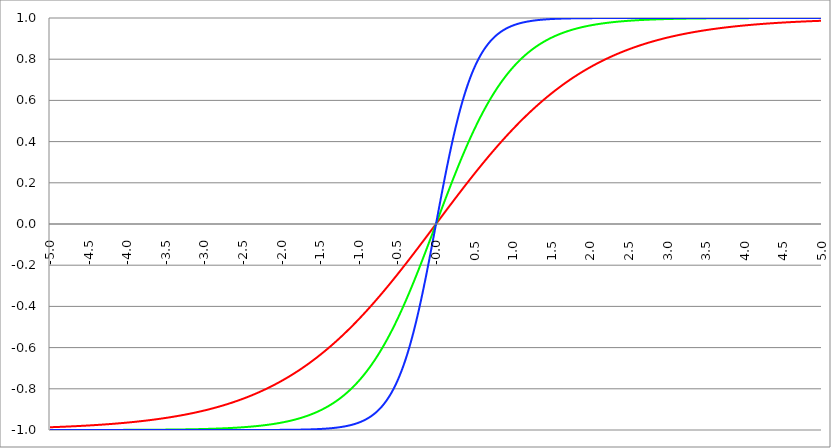
| Category | Series 1 | Series 0 | Series 2 |
|---|---|---|---|
| -5.0 | -0.987 | -1 | -1 |
| -4.995 | -0.987 | -1 | -1 |
| -4.99 | -0.986 | -1 | -1 |
| -4.985 | -0.986 | -1 | -1 |
| -4.98 | -0.986 | -1 | -1 |
| -4.975 | -0.986 | -1 | -1 |
| -4.97 | -0.986 | -1 | -1 |
| -4.965000000000001 | -0.986 | -1 | -1 |
| -4.960000000000001 | -0.986 | -1 | -1 |
| -4.955000000000001 | -0.986 | -1 | -1 |
| -4.950000000000001 | -0.986 | -1 | -1 |
| -4.945000000000001 | -0.986 | -1 | -1 |
| -4.940000000000001 | -0.986 | -1 | -1 |
| -4.935000000000001 | -0.986 | -1 | -1 |
| -4.930000000000001 | -0.986 | -1 | -1 |
| -4.925000000000002 | -0.986 | -1 | -1 |
| -4.920000000000002 | -0.986 | -1 | -1 |
| -4.915000000000002 | -0.985 | -1 | -1 |
| -4.910000000000002 | -0.985 | -1 | -1 |
| -4.905000000000002 | -0.985 | -1 | -1 |
| -4.900000000000002 | -0.985 | -1 | -1 |
| -4.895000000000002 | -0.985 | -1 | -1 |
| -4.890000000000002 | -0.985 | -1 | -1 |
| -4.885000000000002 | -0.985 | -1 | -1 |
| -4.880000000000002 | -0.985 | -1 | -1 |
| -4.875000000000003 | -0.985 | -1 | -1 |
| -4.870000000000003 | -0.985 | -1 | -1 |
| -4.865000000000003 | -0.985 | -1 | -1 |
| -4.860000000000003 | -0.985 | -1 | -1 |
| -4.855000000000003 | -0.985 | -1 | -1 |
| -4.850000000000003 | -0.984 | -1 | -1 |
| -4.845000000000003 | -0.984 | -1 | -1 |
| -4.840000000000003 | -0.984 | -1 | -1 |
| -4.835000000000003 | -0.984 | -1 | -1 |
| -4.830000000000004 | -0.984 | -1 | -1 |
| -4.825000000000004 | -0.984 | -1 | -1 |
| -4.820000000000004 | -0.984 | -1 | -1 |
| -4.815000000000004 | -0.984 | -1 | -1 |
| -4.810000000000004 | -0.984 | -1 | -1 |
| -4.805000000000004 | -0.984 | -1 | -1 |
| -4.800000000000004 | -0.984 | -1 | -1 |
| -4.795000000000004 | -0.984 | -1 | -1 |
| -4.790000000000004 | -0.984 | -1 | -1 |
| -4.785000000000004 | -0.983 | -1 | -1 |
| -4.780000000000004 | -0.983 | -1 | -1 |
| -4.775000000000004 | -0.983 | -1 | -1 |
| -4.770000000000004 | -0.983 | -1 | -1 |
| -4.765000000000005 | -0.983 | -1 | -1 |
| -4.760000000000005 | -0.983 | -1 | -1 |
| -4.755000000000005 | -0.983 | -1 | -1 |
| -4.750000000000005 | -0.983 | -1 | -1 |
| -4.745000000000005 | -0.983 | -1 | -1 |
| -4.740000000000005 | -0.983 | -1 | -1 |
| -4.735000000000005 | -0.983 | -1 | -1 |
| -4.730000000000005 | -0.983 | -1 | -1 |
| -4.725000000000006 | -0.982 | -1 | -1 |
| -4.720000000000006 | -0.982 | -1 | -1 |
| -4.715000000000006 | -0.982 | -1 | -1 |
| -4.710000000000006 | -0.982 | -1 | -1 |
| -4.705000000000006 | -0.982 | -1 | -1 |
| -4.700000000000006 | -0.982 | -1 | -1 |
| -4.695000000000006 | -0.982 | -1 | -1 |
| -4.690000000000006 | -0.982 | -1 | -1 |
| -4.685000000000007 | -0.982 | -1 | -1 |
| -4.680000000000007 | -0.982 | -1 | -1 |
| -4.675000000000007 | -0.982 | -1 | -1 |
| -4.670000000000007 | -0.981 | -1 | -1 |
| -4.665000000000007 | -0.981 | -1 | -1 |
| -4.660000000000007 | -0.981 | -1 | -1 |
| -4.655000000000007 | -0.981 | -1 | -1 |
| -4.650000000000007 | -0.981 | -1 | -1 |
| -4.645000000000007 | -0.981 | -1 | -1 |
| -4.640000000000008 | -0.981 | -1 | -1 |
| -4.635000000000008 | -0.981 | -1 | -1 |
| -4.630000000000008 | -0.981 | -1 | -1 |
| -4.625000000000008 | -0.981 | -1 | -1 |
| -4.620000000000008 | -0.98 | -1 | -1 |
| -4.615000000000008 | -0.98 | -1 | -1 |
| -4.610000000000008 | -0.98 | -1 | -1 |
| -4.605000000000008 | -0.98 | -1 | -1 |
| -4.600000000000008 | -0.98 | -1 | -1 |
| -4.595000000000009 | -0.98 | -1 | -1 |
| -4.590000000000009 | -0.98 | -1 | -1 |
| -4.585000000000009 | -0.98 | -1 | -1 |
| -4.580000000000009 | -0.98 | -1 | -1 |
| -4.57500000000001 | -0.98 | -1 | -1 |
| -4.57000000000001 | -0.979 | -1 | -1 |
| -4.565000000000009 | -0.979 | -1 | -1 |
| -4.560000000000009 | -0.979 | -1 | -1 |
| -4.555000000000009 | -0.979 | -1 | -1 |
| -4.55000000000001 | -0.979 | -1 | -1 |
| -4.54500000000001 | -0.979 | -1 | -1 |
| -4.54000000000001 | -0.979 | -1 | -1 |
| -4.53500000000001 | -0.979 | -1 | -1 |
| -4.53000000000001 | -0.979 | -1 | -1 |
| -4.52500000000001 | -0.979 | -1 | -1 |
| -4.52000000000001 | -0.978 | -1 | -1 |
| -4.51500000000001 | -0.978 | -1 | -1 |
| -4.51000000000001 | -0.978 | -1 | -1 |
| -4.505000000000011 | -0.978 | -1 | -1 |
| -4.500000000000011 | -0.978 | -1 | -1 |
| -4.495000000000011 | -0.978 | -1 | -1 |
| -4.490000000000011 | -0.978 | -1 | -1 |
| -4.485000000000011 | -0.978 | -1 | -1 |
| -4.480000000000011 | -0.978 | -1 | -1 |
| -4.475000000000011 | -0.977 | -1 | -1 |
| -4.470000000000011 | -0.977 | -1 | -1 |
| -4.465000000000011 | -0.977 | -1 | -1 |
| -4.460000000000011 | -0.977 | -1 | -1 |
| -4.455000000000012 | -0.977 | -1 | -1 |
| -4.450000000000012 | -0.977 | -1 | -1 |
| -4.445000000000012 | -0.977 | -1 | -1 |
| -4.440000000000012 | -0.977 | -1 | -1 |
| -4.435000000000012 | -0.977 | -1 | -1 |
| -4.430000000000012 | -0.976 | -1 | -1 |
| -4.425000000000012 | -0.976 | -1 | -1 |
| -4.420000000000012 | -0.976 | -1 | -1 |
| -4.415000000000012 | -0.976 | -1 | -1 |
| -4.410000000000013 | -0.976 | -1 | -1 |
| -4.405000000000013 | -0.976 | -1 | -1 |
| -4.400000000000013 | -0.976 | -1 | -1 |
| -4.395000000000013 | -0.976 | -1 | -1 |
| -4.390000000000013 | -0.976 | -1 | -1 |
| -4.385000000000013 | -0.975 | -1 | -1 |
| -4.380000000000013 | -0.975 | -1 | -1 |
| -4.375000000000013 | -0.975 | -1 | -1 |
| -4.370000000000013 | -0.975 | -1 | -1 |
| -4.365000000000013 | -0.975 | -1 | -1 |
| -4.360000000000014 | -0.975 | -1 | -1 |
| -4.355000000000014 | -0.975 | -1 | -1 |
| -4.350000000000014 | -0.975 | -1 | -1 |
| -4.345000000000014 | -0.974 | -1 | -1 |
| -4.340000000000014 | -0.974 | -1 | -1 |
| -4.335000000000014 | -0.974 | -1 | -1 |
| -4.330000000000014 | -0.974 | -1 | -1 |
| -4.325000000000014 | -0.974 | -1 | -1 |
| -4.320000000000014 | -0.974 | -1 | -1 |
| -4.315000000000015 | -0.974 | -1 | -1 |
| -4.310000000000015 | -0.973 | -1 | -1 |
| -4.305000000000015 | -0.973 | -1 | -1 |
| -4.300000000000015 | -0.973 | -1 | -1 |
| -4.295000000000015 | -0.973 | -1 | -1 |
| -4.290000000000015 | -0.973 | -1 | -1 |
| -4.285000000000015 | -0.973 | -1 | -1 |
| -4.280000000000015 | -0.973 | -1 | -1 |
| -4.275000000000015 | -0.973 | -1 | -1 |
| -4.270000000000015 | -0.972 | -1 | -1 |
| -4.265000000000016 | -0.972 | -1 | -1 |
| -4.260000000000016 | -0.972 | -1 | -1 |
| -4.255000000000016 | -0.972 | -1 | -1 |
| -4.250000000000016 | -0.972 | -1 | -1 |
| -4.245000000000016 | -0.972 | -1 | -1 |
| -4.240000000000016 | -0.972 | -1 | -1 |
| -4.235000000000016 | -0.971 | -1 | -1 |
| -4.230000000000016 | -0.971 | -1 | -1 |
| -4.225000000000017 | -0.971 | -1 | -1 |
| -4.220000000000017 | -0.971 | -1 | -1 |
| -4.215000000000017 | -0.971 | -1 | -1 |
| -4.210000000000017 | -0.971 | -1 | -1 |
| -4.205000000000017 | -0.971 | -1 | -1 |
| -4.200000000000017 | -0.97 | -1 | -1 |
| -4.195000000000017 | -0.97 | -1 | -1 |
| -4.190000000000017 | -0.97 | -1 | -1 |
| -4.185000000000017 | -0.97 | -1 | -1 |
| -4.180000000000017 | -0.97 | -1 | -1 |
| -4.175000000000018 | -0.97 | -1 | -1 |
| -4.170000000000018 | -0.97 | -1 | -1 |
| -4.165000000000018 | -0.969 | -1 | -1 |
| -4.160000000000018 | -0.969 | -1 | -1 |
| -4.155000000000018 | -0.969 | -1 | -1 |
| -4.150000000000018 | -0.969 | -1 | -1 |
| -4.145000000000018 | -0.969 | -0.999 | -1 |
| -4.140000000000018 | -0.969 | -0.999 | -1 |
| -4.135000000000018 | -0.968 | -0.999 | -1 |
| -4.130000000000019 | -0.968 | -0.999 | -1 |
| -4.125000000000019 | -0.968 | -0.999 | -1 |
| -4.120000000000019 | -0.968 | -0.999 | -1 |
| -4.115000000000019 | -0.968 | -0.999 | -1 |
| -4.110000000000019 | -0.968 | -0.999 | -1 |
| -4.105000000000019 | -0.968 | -0.999 | -1 |
| -4.100000000000019 | -0.967 | -0.999 | -1 |
| -4.095000000000019 | -0.967 | -0.999 | -1 |
| -4.090000000000019 | -0.967 | -0.999 | -1 |
| -4.085000000000019 | -0.967 | -0.999 | -1 |
| -4.08000000000002 | -0.967 | -0.999 | -1 |
| -4.07500000000002 | -0.967 | -0.999 | -1 |
| -4.07000000000002 | -0.966 | -0.999 | -1 |
| -4.06500000000002 | -0.966 | -0.999 | -1 |
| -4.06000000000002 | -0.966 | -0.999 | -1 |
| -4.05500000000002 | -0.966 | -0.999 | -1 |
| -4.05000000000002 | -0.966 | -0.999 | -1 |
| -4.04500000000002 | -0.966 | -0.999 | -1 |
| -4.04000000000002 | -0.965 | -0.999 | -1 |
| -4.03500000000002 | -0.965 | -0.999 | -1 |
| -4.03000000000002 | -0.965 | -0.999 | -1 |
| -4.025000000000021 | -0.965 | -0.999 | -1 |
| -4.020000000000021 | -0.965 | -0.999 | -1 |
| -4.015000000000021 | -0.965 | -0.999 | -1 |
| -4.010000000000021 | -0.964 | -0.999 | -1 |
| -4.005000000000021 | -0.964 | -0.999 | -1 |
| -4.000000000000021 | -0.964 | -0.999 | -1 |
| -3.995000000000021 | -0.964 | -0.999 | -1 |
| -3.990000000000021 | -0.964 | -0.999 | -1 |
| -3.985000000000022 | -0.963 | -0.999 | -1 |
| -3.980000000000022 | -0.963 | -0.999 | -1 |
| -3.975000000000022 | -0.963 | -0.999 | -1 |
| -3.970000000000022 | -0.963 | -0.999 | -1 |
| -3.965000000000022 | -0.963 | -0.999 | -1 |
| -3.960000000000022 | -0.963 | -0.999 | -1 |
| -3.955000000000022 | -0.962 | -0.999 | -1 |
| -3.950000000000022 | -0.962 | -0.999 | -1 |
| -3.945000000000022 | -0.962 | -0.999 | -1 |
| -3.940000000000023 | -0.962 | -0.999 | -1 |
| -3.935000000000023 | -0.962 | -0.999 | -1 |
| -3.930000000000023 | -0.961 | -0.999 | -1 |
| -3.925000000000023 | -0.961 | -0.999 | -1 |
| -3.920000000000023 | -0.961 | -0.999 | -1 |
| -3.915000000000023 | -0.961 | -0.999 | -1 |
| -3.910000000000023 | -0.961 | -0.999 | -1 |
| -3.905000000000023 | -0.961 | -0.999 | -1 |
| -3.900000000000023 | -0.96 | -0.999 | -1 |
| -3.895000000000023 | -0.96 | -0.999 | -1 |
| -3.890000000000024 | -0.96 | -0.999 | -1 |
| -3.885000000000024 | -0.96 | -0.999 | -1 |
| -3.880000000000024 | -0.96 | -0.999 | -1 |
| -3.875000000000024 | -0.959 | -0.999 | -1 |
| -3.870000000000024 | -0.959 | -0.999 | -1 |
| -3.865000000000024 | -0.959 | -0.999 | -1 |
| -3.860000000000024 | -0.959 | -0.999 | -1 |
| -3.855000000000024 | -0.959 | -0.999 | -1 |
| -3.850000000000024 | -0.958 | -0.999 | -1 |
| -3.845000000000025 | -0.958 | -0.999 | -1 |
| -3.840000000000025 | -0.958 | -0.999 | -1 |
| -3.835000000000025 | -0.958 | -0.999 | -1 |
| -3.830000000000025 | -0.958 | -0.999 | -1 |
| -3.825000000000025 | -0.957 | -0.999 | -1 |
| -3.820000000000025 | -0.957 | -0.999 | -1 |
| -3.815000000000025 | -0.957 | -0.999 | -1 |
| -3.810000000000025 | -0.957 | -0.999 | -1 |
| -3.805000000000025 | -0.956 | -0.999 | -1 |
| -3.800000000000026 | -0.956 | -0.999 | -1 |
| -3.795000000000026 | -0.956 | -0.999 | -1 |
| -3.790000000000026 | -0.956 | -0.999 | -1 |
| -3.785000000000026 | -0.956 | -0.999 | -1 |
| -3.780000000000026 | -0.955 | -0.999 | -1 |
| -3.775000000000026 | -0.955 | -0.999 | -1 |
| -3.770000000000026 | -0.955 | -0.999 | -1 |
| -3.765000000000026 | -0.955 | -0.999 | -1 |
| -3.760000000000026 | -0.954 | -0.999 | -1 |
| -3.755000000000026 | -0.954 | -0.999 | -1 |
| -3.750000000000027 | -0.954 | -0.999 | -1 |
| -3.745000000000027 | -0.954 | -0.999 | -1 |
| -3.740000000000027 | -0.954 | -0.999 | -1 |
| -3.735000000000027 | -0.953 | -0.999 | -1 |
| -3.730000000000027 | -0.953 | -0.999 | -1 |
| -3.725000000000027 | -0.953 | -0.999 | -1 |
| -3.720000000000027 | -0.953 | -0.999 | -1 |
| -3.715000000000027 | -0.952 | -0.999 | -1 |
| -3.710000000000027 | -0.952 | -0.999 | -1 |
| -3.705000000000028 | -0.952 | -0.999 | -1 |
| -3.700000000000028 | -0.952 | -0.999 | -1 |
| -3.695000000000028 | -0.952 | -0.999 | -1 |
| -3.690000000000028 | -0.951 | -0.999 | -1 |
| -3.685000000000028 | -0.951 | -0.999 | -1 |
| -3.680000000000028 | -0.951 | -0.999 | -1 |
| -3.675000000000028 | -0.951 | -0.999 | -1 |
| -3.670000000000028 | -0.95 | -0.999 | -1 |
| -3.665000000000028 | -0.95 | -0.999 | -1 |
| -3.660000000000028 | -0.95 | -0.999 | -1 |
| -3.655000000000029 | -0.95 | -0.999 | -1 |
| -3.650000000000029 | -0.949 | -0.999 | -1 |
| -3.645000000000029 | -0.949 | -0.999 | -1 |
| -3.640000000000029 | -0.949 | -0.999 | -1 |
| -3.635000000000029 | -0.949 | -0.999 | -1 |
| -3.630000000000029 | -0.948 | -0.999 | -1 |
| -3.625000000000029 | -0.948 | -0.999 | -1 |
| -3.620000000000029 | -0.948 | -0.999 | -1 |
| -3.615000000000029 | -0.948 | -0.999 | -1 |
| -3.61000000000003 | -0.947 | -0.999 | -1 |
| -3.60500000000003 | -0.947 | -0.999 | -1 |
| -3.60000000000003 | -0.947 | -0.999 | -1 |
| -3.59500000000003 | -0.947 | -0.998 | -1 |
| -3.59000000000003 | -0.946 | -0.998 | -1 |
| -3.58500000000003 | -0.946 | -0.998 | -1 |
| -3.58000000000003 | -0.946 | -0.998 | -1 |
| -3.57500000000003 | -0.945 | -0.998 | -1 |
| -3.57000000000003 | -0.945 | -0.998 | -1 |
| -3.565000000000031 | -0.945 | -0.998 | -1 |
| -3.560000000000031 | -0.945 | -0.998 | -1 |
| -3.555000000000031 | -0.944 | -0.998 | -1 |
| -3.550000000000031 | -0.944 | -0.998 | -1 |
| -3.545000000000031 | -0.944 | -0.998 | -1 |
| -3.540000000000031 | -0.944 | -0.998 | -1 |
| -3.535000000000031 | -0.943 | -0.998 | -1 |
| -3.530000000000031 | -0.943 | -0.998 | -1 |
| -3.525000000000031 | -0.943 | -0.998 | -1 |
| -3.520000000000032 | -0.943 | -0.998 | -1 |
| -3.515000000000032 | -0.942 | -0.998 | -1 |
| -3.510000000000032 | -0.942 | -0.998 | -1 |
| -3.505000000000032 | -0.942 | -0.998 | -1 |
| -3.500000000000032 | -0.941 | -0.998 | -1 |
| -3.495000000000032 | -0.941 | -0.998 | -1 |
| -3.490000000000032 | -0.941 | -0.998 | -1 |
| -3.485000000000032 | -0.941 | -0.998 | -1 |
| -3.480000000000032 | -0.94 | -0.998 | -1 |
| -3.475000000000032 | -0.94 | -0.998 | -1 |
| -3.470000000000033 | -0.94 | -0.998 | -1 |
| -3.465000000000033 | -0.939 | -0.998 | -1 |
| -3.460000000000033 | -0.939 | -0.998 | -1 |
| -3.455000000000033 | -0.939 | -0.998 | -1 |
| -3.450000000000033 | -0.938 | -0.998 | -1 |
| -3.445000000000033 | -0.938 | -0.998 | -1 |
| -3.440000000000033 | -0.938 | -0.998 | -1 |
| -3.435000000000033 | -0.938 | -0.998 | -1 |
| -3.430000000000033 | -0.937 | -0.998 | -1 |
| -3.425000000000034 | -0.937 | -0.998 | -1 |
| -3.420000000000034 | -0.937 | -0.998 | -1 |
| -3.415000000000034 | -0.936 | -0.998 | -1 |
| -3.410000000000034 | -0.936 | -0.998 | -1 |
| -3.405000000000034 | -0.936 | -0.998 | -1 |
| -3.400000000000034 | -0.935 | -0.998 | -1 |
| -3.395000000000034 | -0.935 | -0.998 | -1 |
| -3.390000000000034 | -0.935 | -0.998 | -1 |
| -3.385000000000034 | -0.934 | -0.998 | -1 |
| -3.380000000000034 | -0.934 | -0.998 | -1 |
| -3.375000000000035 | -0.934 | -0.998 | -1 |
| -3.370000000000035 | -0.934 | -0.998 | -1 |
| -3.365000000000035 | -0.933 | -0.998 | -1 |
| -3.360000000000035 | -0.933 | -0.998 | -1 |
| -3.355000000000035 | -0.933 | -0.998 | -1 |
| -3.350000000000035 | -0.932 | -0.998 | -1 |
| -3.345000000000035 | -0.932 | -0.998 | -1 |
| -3.340000000000035 | -0.932 | -0.997 | -1 |
| -3.335000000000035 | -0.931 | -0.997 | -1 |
| -3.330000000000036 | -0.931 | -0.997 | -1 |
| -3.325000000000036 | -0.931 | -0.997 | -1 |
| -3.320000000000036 | -0.93 | -0.997 | -1 |
| -3.315000000000036 | -0.93 | -0.997 | -1 |
| -3.310000000000036 | -0.93 | -0.997 | -1 |
| -3.305000000000036 | -0.929 | -0.997 | -1 |
| -3.300000000000036 | -0.929 | -0.997 | -1 |
| -3.295000000000036 | -0.929 | -0.997 | -1 |
| -3.290000000000036 | -0.928 | -0.997 | -1 |
| -3.285000000000036 | -0.928 | -0.997 | -1 |
| -3.280000000000036 | -0.927 | -0.997 | -1 |
| -3.275000000000037 | -0.927 | -0.997 | -1 |
| -3.270000000000037 | -0.927 | -0.997 | -1 |
| -3.265000000000037 | -0.926 | -0.997 | -1 |
| -3.260000000000037 | -0.926 | -0.997 | -1 |
| -3.255000000000037 | -0.926 | -0.997 | -1 |
| -3.250000000000037 | -0.925 | -0.997 | -1 |
| -3.245000000000037 | -0.925 | -0.997 | -1 |
| -3.240000000000037 | -0.925 | -0.997 | -1 |
| -3.235000000000038 | -0.924 | -0.997 | -1 |
| -3.230000000000038 | -0.924 | -0.997 | -1 |
| -3.225000000000038 | -0.924 | -0.997 | -1 |
| -3.220000000000038 | -0.923 | -0.997 | -1 |
| -3.215000000000038 | -0.923 | -0.997 | -1 |
| -3.210000000000038 | -0.922 | -0.997 | -1 |
| -3.205000000000038 | -0.922 | -0.997 | -1 |
| -3.200000000000038 | -0.922 | -0.997 | -1 |
| -3.195000000000038 | -0.921 | -0.997 | -1 |
| -3.190000000000039 | -0.921 | -0.997 | -1 |
| -3.185000000000039 | -0.921 | -0.997 | -1 |
| -3.180000000000039 | -0.92 | -0.997 | -1 |
| -3.175000000000039 | -0.92 | -0.997 | -1 |
| -3.170000000000039 | -0.919 | -0.996 | -1 |
| -3.16500000000004 | -0.919 | -0.996 | -1 |
| -3.16000000000004 | -0.919 | -0.996 | -1 |
| -3.155000000000039 | -0.918 | -0.996 | -1 |
| -3.150000000000039 | -0.918 | -0.996 | -1 |
| -3.14500000000004 | -0.917 | -0.996 | -1 |
| -3.14000000000004 | -0.917 | -0.996 | -1 |
| -3.13500000000004 | -0.917 | -0.996 | -1 |
| -3.13000000000004 | -0.916 | -0.996 | -1 |
| -3.12500000000004 | -0.916 | -0.996 | -1 |
| -3.12000000000004 | -0.915 | -0.996 | -1 |
| -3.11500000000004 | -0.915 | -0.996 | -1 |
| -3.11000000000004 | -0.915 | -0.996 | -1 |
| -3.10500000000004 | -0.914 | -0.996 | -1 |
| -3.10000000000004 | -0.914 | -0.996 | -1 |
| -3.095000000000041 | -0.913 | -0.996 | -1 |
| -3.090000000000041 | -0.913 | -0.996 | -1 |
| -3.085000000000041 | -0.913 | -0.996 | -1 |
| -3.080000000000041 | -0.912 | -0.996 | -1 |
| -3.075000000000041 | -0.912 | -0.996 | -1 |
| -3.070000000000041 | -0.911 | -0.996 | -1 |
| -3.065000000000041 | -0.911 | -0.996 | -1 |
| -3.060000000000041 | -0.91 | -0.996 | -1 |
| -3.055000000000041 | -0.91 | -0.996 | -1 |
| -3.050000000000042 | -0.91 | -0.996 | -1 |
| -3.045000000000042 | -0.909 | -0.995 | -1 |
| -3.040000000000042 | -0.909 | -0.995 | -1 |
| -3.035000000000042 | -0.908 | -0.995 | -1 |
| -3.030000000000042 | -0.908 | -0.995 | -1 |
| -3.025000000000042 | -0.907 | -0.995 | -1 |
| -3.020000000000042 | -0.907 | -0.995 | -1 |
| -3.015000000000042 | -0.906 | -0.995 | -1 |
| -3.010000000000042 | -0.906 | -0.995 | -1 |
| -3.005000000000043 | -0.906 | -0.995 | -1 |
| -3.000000000000043 | -0.905 | -0.995 | -1 |
| -2.995000000000043 | -0.905 | -0.995 | -1 |
| -2.990000000000043 | -0.904 | -0.995 | -1 |
| -2.985000000000043 | -0.904 | -0.995 | -1 |
| -2.980000000000043 | -0.903 | -0.995 | -1 |
| -2.975000000000043 | -0.903 | -0.995 | -1 |
| -2.970000000000043 | -0.902 | -0.995 | -1 |
| -2.965000000000043 | -0.902 | -0.995 | -1 |
| -2.960000000000043 | -0.901 | -0.995 | -1 |
| -2.955000000000044 | -0.901 | -0.995 | -1 |
| -2.950000000000044 | -0.901 | -0.995 | -1 |
| -2.945000000000044 | -0.9 | -0.994 | -1 |
| -2.940000000000044 | -0.9 | -0.994 | -1 |
| -2.935000000000044 | -0.899 | -0.994 | -1 |
| -2.930000000000044 | -0.899 | -0.994 | -1 |
| -2.925000000000044 | -0.898 | -0.994 | -1 |
| -2.920000000000044 | -0.898 | -0.994 | -1 |
| -2.915000000000044 | -0.897 | -0.994 | -1 |
| -2.910000000000045 | -0.897 | -0.994 | -1 |
| -2.905000000000045 | -0.896 | -0.994 | -1 |
| -2.900000000000045 | -0.896 | -0.994 | -1 |
| -2.895000000000045 | -0.895 | -0.994 | -1 |
| -2.890000000000045 | -0.895 | -0.994 | -1 |
| -2.885000000000045 | -0.894 | -0.994 | -1 |
| -2.880000000000045 | -0.894 | -0.994 | -1 |
| -2.875000000000045 | -0.893 | -0.994 | -1 |
| -2.870000000000045 | -0.893 | -0.994 | -1 |
| -2.865000000000045 | -0.892 | -0.994 | -1 |
| -2.860000000000046 | -0.892 | -0.993 | -1 |
| -2.855000000000046 | -0.891 | -0.993 | -1 |
| -2.850000000000046 | -0.891 | -0.993 | -1 |
| -2.845000000000046 | -0.89 | -0.993 | -1 |
| -2.840000000000046 | -0.89 | -0.993 | -1 |
| -2.835000000000046 | -0.889 | -0.993 | -1 |
| -2.830000000000046 | -0.889 | -0.993 | -1 |
| -2.825000000000046 | -0.888 | -0.993 | -1 |
| -2.820000000000046 | -0.887 | -0.993 | -1 |
| -2.815000000000047 | -0.887 | -0.993 | -1 |
| -2.810000000000047 | -0.886 | -0.993 | -1 |
| -2.805000000000047 | -0.886 | -0.993 | -1 |
| -2.800000000000047 | -0.885 | -0.993 | -1 |
| -2.795000000000047 | -0.885 | -0.993 | -1 |
| -2.790000000000047 | -0.884 | -0.992 | -1 |
| -2.785000000000047 | -0.884 | -0.992 | -1 |
| -2.780000000000047 | -0.883 | -0.992 | -1 |
| -2.775000000000047 | -0.883 | -0.992 | -1 |
| -2.770000000000047 | -0.882 | -0.992 | -1 |
| -2.765000000000048 | -0.882 | -0.992 | -1 |
| -2.760000000000048 | -0.881 | -0.992 | -1 |
| -2.755000000000048 | -0.88 | -0.992 | -1 |
| -2.750000000000048 | -0.88 | -0.992 | -1 |
| -2.745000000000048 | -0.879 | -0.992 | -1 |
| -2.740000000000048 | -0.879 | -0.992 | -1 |
| -2.735000000000048 | -0.878 | -0.992 | -1 |
| -2.730000000000048 | -0.878 | -0.992 | -1 |
| -2.725000000000048 | -0.877 | -0.991 | -1 |
| -2.720000000000049 | -0.876 | -0.991 | -1 |
| -2.715000000000049 | -0.876 | -0.991 | -1 |
| -2.710000000000049 | -0.875 | -0.991 | -1 |
| -2.705000000000049 | -0.875 | -0.991 | -1 |
| -2.700000000000049 | -0.874 | -0.991 | -1 |
| -2.695000000000049 | -0.873 | -0.991 | -1 |
| -2.690000000000049 | -0.873 | -0.991 | -1 |
| -2.685000000000049 | -0.872 | -0.991 | -1 |
| -2.680000000000049 | -0.872 | -0.991 | -1 |
| -2.675000000000049 | -0.871 | -0.991 | -1 |
| -2.67000000000005 | -0.87 | -0.99 | -1 |
| -2.66500000000005 | -0.87 | -0.99 | -1 |
| -2.66000000000005 | -0.869 | -0.99 | -1 |
| -2.65500000000005 | -0.869 | -0.99 | -1 |
| -2.65000000000005 | -0.868 | -0.99 | -1 |
| -2.64500000000005 | -0.867 | -0.99 | -1 |
| -2.64000000000005 | -0.867 | -0.99 | -1 |
| -2.63500000000005 | -0.866 | -0.99 | -1 |
| -2.63000000000005 | -0.866 | -0.99 | -1 |
| -2.625000000000051 | -0.865 | -0.99 | -1 |
| -2.620000000000051 | -0.864 | -0.989 | -1 |
| -2.615000000000051 | -0.864 | -0.989 | -1 |
| -2.610000000000051 | -0.863 | -0.989 | -1 |
| -2.605000000000051 | -0.862 | -0.989 | -1 |
| -2.600000000000051 | -0.862 | -0.989 | -1 |
| -2.595000000000051 | -0.861 | -0.989 | -1 |
| -2.590000000000051 | -0.86 | -0.989 | -1 |
| -2.585000000000051 | -0.86 | -0.989 | -1 |
| -2.580000000000052 | -0.859 | -0.989 | -1 |
| -2.575000000000052 | -0.858 | -0.988 | -1 |
| -2.570000000000052 | -0.858 | -0.988 | -1 |
| -2.565000000000052 | -0.857 | -0.988 | -1 |
| -2.560000000000052 | -0.856 | -0.988 | -1 |
| -2.555000000000052 | -0.856 | -0.988 | -1 |
| -2.550000000000052 | -0.855 | -0.988 | -1 |
| -2.545000000000052 | -0.854 | -0.988 | -1 |
| -2.540000000000052 | -0.854 | -0.988 | -1 |
| -2.535000000000053 | -0.853 | -0.988 | -1 |
| -2.530000000000053 | -0.852 | -0.987 | -1 |
| -2.525000000000053 | -0.852 | -0.987 | -1 |
| -2.520000000000053 | -0.851 | -0.987 | -1 |
| -2.515000000000053 | -0.85 | -0.987 | -1 |
| -2.510000000000053 | -0.85 | -0.987 | -1 |
| -2.505000000000053 | -0.849 | -0.987 | -1 |
| -2.500000000000053 | -0.848 | -0.987 | -1 |
| -2.495000000000053 | -0.848 | -0.986 | -1 |
| -2.490000000000053 | -0.847 | -0.986 | -1 |
| -2.485000000000054 | -0.846 | -0.986 | -1 |
| -2.480000000000054 | -0.845 | -0.986 | -1 |
| -2.475000000000054 | -0.845 | -0.986 | -1 |
| -2.470000000000054 | -0.844 | -0.986 | -1 |
| -2.465000000000054 | -0.843 | -0.986 | -1 |
| -2.460000000000054 | -0.843 | -0.986 | -1 |
| -2.455000000000054 | -0.842 | -0.985 | -1 |
| -2.450000000000054 | -0.841 | -0.985 | -1 |
| -2.445000000000054 | -0.84 | -0.985 | -1 |
| -2.440000000000055 | -0.84 | -0.985 | -1 |
| -2.435000000000055 | -0.839 | -0.985 | -1 |
| -2.430000000000055 | -0.838 | -0.985 | -1 |
| -2.425000000000055 | -0.837 | -0.984 | -1 |
| -2.420000000000055 | -0.837 | -0.984 | -1 |
| -2.415000000000055 | -0.836 | -0.984 | -1 |
| -2.410000000000055 | -0.835 | -0.984 | -1 |
| -2.405000000000055 | -0.834 | -0.984 | -1 |
| -2.400000000000055 | -0.834 | -0.984 | -1 |
| -2.395000000000055 | -0.833 | -0.984 | -1 |
| -2.390000000000056 | -0.832 | -0.983 | -1 |
| -2.385000000000056 | -0.831 | -0.983 | -1 |
| -2.380000000000056 | -0.831 | -0.983 | -1 |
| -2.375000000000056 | -0.83 | -0.983 | -1 |
| -2.370000000000056 | -0.829 | -0.983 | -1 |
| -2.365000000000056 | -0.828 | -0.983 | -1 |
| -2.360000000000056 | -0.827 | -0.982 | -1 |
| -2.355000000000056 | -0.827 | -0.982 | -1 |
| -2.350000000000056 | -0.826 | -0.982 | -1 |
| -2.345000000000057 | -0.825 | -0.982 | -1 |
| -2.340000000000057 | -0.824 | -0.982 | -1 |
| -2.335000000000057 | -0.823 | -0.981 | -1 |
| -2.330000000000057 | -0.823 | -0.981 | -1 |
| -2.325000000000057 | -0.822 | -0.981 | -1 |
| -2.320000000000057 | -0.821 | -0.981 | -1 |
| -2.315000000000057 | -0.82 | -0.981 | -1 |
| -2.310000000000057 | -0.819 | -0.98 | -1 |
| -2.305000000000057 | -0.819 | -0.98 | -1 |
| -2.300000000000058 | -0.818 | -0.98 | -1 |
| -2.295000000000058 | -0.817 | -0.98 | -1 |
| -2.290000000000058 | -0.816 | -0.98 | -1 |
| -2.285000000000058 | -0.815 | -0.979 | -1 |
| -2.280000000000058 | -0.814 | -0.979 | -1 |
| -2.275000000000058 | -0.814 | -0.979 | -1 |
| -2.270000000000058 | -0.813 | -0.979 | -1 |
| -2.265000000000058 | -0.812 | -0.979 | -1 |
| -2.260000000000058 | -0.811 | -0.978 | -1 |
| -2.255000000000058 | -0.81 | -0.978 | -1 |
| -2.250000000000059 | -0.809 | -0.978 | -1 |
| -2.245000000000059 | -0.808 | -0.978 | -1 |
| -2.240000000000059 | -0.808 | -0.978 | -1 |
| -2.235000000000059 | -0.807 | -0.977 | -1 |
| -2.23000000000006 | -0.806 | -0.977 | -1 |
| -2.22500000000006 | -0.805 | -0.977 | -1 |
| -2.22000000000006 | -0.804 | -0.977 | -1 |
| -2.215000000000059 | -0.803 | -0.976 | -1 |
| -2.210000000000059 | -0.802 | -0.976 | -1 |
| -2.20500000000006 | -0.801 | -0.976 | -1 |
| -2.20000000000006 | -0.8 | -0.976 | -1 |
| -2.19500000000006 | -0.8 | -0.976 | -1 |
| -2.19000000000006 | -0.799 | -0.975 | -1 |
| -2.18500000000006 | -0.798 | -0.975 | -1 |
| -2.18000000000006 | -0.797 | -0.975 | -1 |
| -2.17500000000006 | -0.796 | -0.975 | -1 |
| -2.17000000000006 | -0.795 | -0.974 | -1 |
| -2.16500000000006 | -0.794 | -0.974 | -1 |
| -2.160000000000061 | -0.793 | -0.974 | -1 |
| -2.155000000000061 | -0.792 | -0.973 | -1 |
| -2.150000000000061 | -0.791 | -0.973 | -1 |
| -2.145000000000061 | -0.79 | -0.973 | -1 |
| -2.140000000000061 | -0.789 | -0.973 | -1 |
| -2.135000000000061 | -0.789 | -0.972 | -1 |
| -2.130000000000061 | -0.788 | -0.972 | -1 |
| -2.125000000000061 | -0.787 | -0.972 | -1 |
| -2.120000000000061 | -0.786 | -0.972 | -1 |
| -2.115000000000061 | -0.785 | -0.971 | -1 |
| -2.110000000000062 | -0.784 | -0.971 | -1 |
| -2.105000000000062 | -0.783 | -0.971 | -1 |
| -2.100000000000062 | -0.782 | -0.97 | -1 |
| -2.095000000000062 | -0.781 | -0.97 | -1 |
| -2.090000000000062 | -0.78 | -0.97 | -1 |
| -2.085000000000062 | -0.779 | -0.97 | -1 |
| -2.080000000000062 | -0.778 | -0.969 | -1 |
| -2.075000000000062 | -0.777 | -0.969 | -1 |
| -2.070000000000062 | -0.776 | -0.969 | -0.999 |
| -2.065000000000063 | -0.775 | -0.968 | -0.999 |
| -2.060000000000063 | -0.774 | -0.968 | -0.999 |
| -2.055000000000063 | -0.773 | -0.968 | -0.999 |
| -2.050000000000063 | -0.772 | -0.967 | -0.999 |
| -2.045000000000063 | -0.771 | -0.967 | -0.999 |
| -2.040000000000063 | -0.77 | -0.967 | -0.999 |
| -2.035000000000063 | -0.769 | -0.966 | -0.999 |
| -2.030000000000063 | -0.768 | -0.966 | -0.999 |
| -2.025000000000063 | -0.767 | -0.966 | -0.999 |
| -2.020000000000064 | -0.766 | -0.965 | -0.999 |
| -2.015000000000064 | -0.765 | -0.965 | -0.999 |
| -2.010000000000064 | -0.764 | -0.965 | -0.999 |
| -2.005000000000064 | -0.763 | -0.964 | -0.999 |
| -2.000000000000064 | -0.762 | -0.964 | -0.999 |
| -1.995000000000064 | -0.761 | -0.964 | -0.999 |
| -1.990000000000064 | -0.759 | -0.963 | -0.999 |
| -1.985000000000064 | -0.758 | -0.963 | -0.999 |
| -1.980000000000064 | -0.757 | -0.963 | -0.999 |
| -1.975000000000064 | -0.756 | -0.962 | -0.999 |
| -1.970000000000065 | -0.755 | -0.962 | -0.999 |
| -1.965000000000065 | -0.754 | -0.961 | -0.999 |
| -1.960000000000065 | -0.753 | -0.961 | -0.999 |
| -1.955000000000065 | -0.752 | -0.961 | -0.999 |
| -1.950000000000065 | -0.751 | -0.96 | -0.999 |
| -1.945000000000065 | -0.75 | -0.96 | -0.999 |
| -1.940000000000065 | -0.749 | -0.96 | -0.999 |
| -1.935000000000065 | -0.748 | -0.959 | -0.999 |
| -1.930000000000065 | -0.746 | -0.959 | -0.999 |
| -1.925000000000066 | -0.745 | -0.958 | -0.999 |
| -1.920000000000066 | -0.744 | -0.958 | -0.999 |
| -1.915000000000066 | -0.743 | -0.958 | -0.999 |
| -1.910000000000066 | -0.742 | -0.957 | -0.999 |
| -1.905000000000066 | -0.741 | -0.957 | -0.999 |
| -1.900000000000066 | -0.74 | -0.956 | -0.999 |
| -1.895000000000066 | -0.739 | -0.956 | -0.999 |
| -1.890000000000066 | -0.738 | -0.955 | -0.999 |
| -1.885000000000066 | -0.736 | -0.955 | -0.999 |
| -1.880000000000066 | -0.735 | -0.954 | -0.999 |
| -1.875000000000067 | -0.734 | -0.954 | -0.999 |
| -1.870000000000067 | -0.733 | -0.954 | -0.999 |
| -1.865000000000067 | -0.732 | -0.953 | -0.999 |
| -1.860000000000067 | -0.731 | -0.953 | -0.999 |
| -1.855000000000067 | -0.729 | -0.952 | -0.999 |
| -1.850000000000067 | -0.728 | -0.952 | -0.999 |
| -1.845000000000067 | -0.727 | -0.951 | -0.999 |
| -1.840000000000067 | -0.726 | -0.951 | -0.999 |
| -1.835000000000067 | -0.725 | -0.95 | -0.999 |
| -1.830000000000068 | -0.724 | -0.95 | -0.999 |
| -1.825000000000068 | -0.722 | -0.949 | -0.999 |
| -1.820000000000068 | -0.721 | -0.949 | -0.999 |
| -1.815000000000068 | -0.72 | -0.948 | -0.999 |
| -1.810000000000068 | -0.719 | -0.948 | -0.999 |
| -1.805000000000068 | -0.718 | -0.947 | -0.999 |
| -1.800000000000068 | -0.716 | -0.947 | -0.999 |
| -1.795000000000068 | -0.715 | -0.946 | -0.998 |
| -1.790000000000068 | -0.714 | -0.946 | -0.998 |
| -1.785000000000068 | -0.713 | -0.945 | -0.998 |
| -1.780000000000069 | -0.711 | -0.945 | -0.998 |
| -1.775000000000069 | -0.71 | -0.944 | -0.998 |
| -1.770000000000069 | -0.709 | -0.944 | -0.998 |
| -1.765000000000069 | -0.708 | -0.943 | -0.998 |
| -1.760000000000069 | -0.706 | -0.943 | -0.998 |
| -1.75500000000007 | -0.705 | -0.942 | -0.998 |
| -1.75000000000007 | -0.704 | -0.941 | -0.998 |
| -1.745000000000069 | -0.703 | -0.941 | -0.998 |
| -1.740000000000069 | -0.701 | -0.94 | -0.998 |
| -1.73500000000007 | -0.7 | -0.94 | -0.998 |
| -1.73000000000007 | -0.699 | -0.939 | -0.998 |
| -1.72500000000007 | -0.698 | -0.938 | -0.998 |
| -1.72000000000007 | -0.696 | -0.938 | -0.998 |
| -1.71500000000007 | -0.695 | -0.937 | -0.998 |
| -1.71000000000007 | -0.694 | -0.937 | -0.998 |
| -1.70500000000007 | -0.692 | -0.936 | -0.998 |
| -1.70000000000007 | -0.691 | -0.935 | -0.998 |
| -1.69500000000007 | -0.69 | -0.935 | -0.998 |
| -1.69000000000007 | -0.688 | -0.934 | -0.998 |
| -1.685000000000071 | -0.687 | -0.934 | -0.998 |
| -1.680000000000071 | -0.686 | -0.933 | -0.998 |
| -1.675000000000071 | -0.684 | -0.932 | -0.998 |
| -1.670000000000071 | -0.683 | -0.932 | -0.997 |
| -1.665000000000071 | -0.682 | -0.931 | -0.997 |
| -1.660000000000071 | -0.68 | -0.93 | -0.997 |
| -1.655000000000071 | -0.679 | -0.93 | -0.997 |
| -1.650000000000071 | -0.678 | -0.929 | -0.997 |
| -1.645000000000071 | -0.676 | -0.928 | -0.997 |
| -1.640000000000072 | -0.675 | -0.927 | -0.997 |
| -1.635000000000072 | -0.674 | -0.927 | -0.997 |
| -1.630000000000072 | -0.672 | -0.926 | -0.997 |
| -1.625000000000072 | -0.671 | -0.925 | -0.997 |
| -1.620000000000072 | -0.67 | -0.925 | -0.997 |
| -1.615000000000072 | -0.668 | -0.924 | -0.997 |
| -1.610000000000072 | -0.667 | -0.923 | -0.997 |
| -1.605000000000072 | -0.665 | -0.922 | -0.997 |
| -1.600000000000072 | -0.664 | -0.922 | -0.997 |
| -1.595000000000073 | -0.663 | -0.921 | -0.997 |
| -1.590000000000073 | -0.661 | -0.92 | -0.997 |
| -1.585000000000073 | -0.66 | -0.919 | -0.996 |
| -1.580000000000073 | -0.658 | -0.919 | -0.996 |
| -1.575000000000073 | -0.657 | -0.918 | -0.996 |
| -1.570000000000073 | -0.656 | -0.917 | -0.996 |
| -1.565000000000073 | -0.654 | -0.916 | -0.996 |
| -1.560000000000073 | -0.653 | -0.915 | -0.996 |
| -1.555000000000073 | -0.651 | -0.915 | -0.996 |
| -1.550000000000074 | -0.65 | -0.914 | -0.996 |
| -1.545000000000074 | -0.648 | -0.913 | -0.996 |
| -1.540000000000074 | -0.647 | -0.912 | -0.996 |
| -1.535000000000074 | -0.645 | -0.911 | -0.996 |
| -1.530000000000074 | -0.644 | -0.91 | -0.996 |
| -1.525000000000074 | -0.643 | -0.91 | -0.996 |
| -1.520000000000074 | -0.641 | -0.909 | -0.995 |
| -1.515000000000074 | -0.64 | -0.908 | -0.995 |
| -1.510000000000074 | -0.638 | -0.907 | -0.995 |
| -1.505000000000074 | -0.637 | -0.906 | -0.995 |
| -1.500000000000075 | -0.635 | -0.905 | -0.995 |
| -1.495000000000075 | -0.634 | -0.904 | -0.995 |
| -1.490000000000075 | -0.632 | -0.903 | -0.995 |
| -1.485000000000075 | -0.631 | -0.902 | -0.995 |
| -1.480000000000075 | -0.629 | -0.901 | -0.995 |
| -1.475000000000075 | -0.628 | -0.901 | -0.995 |
| -1.470000000000075 | -0.626 | -0.9 | -0.994 |
| -1.465000000000075 | -0.625 | -0.899 | -0.994 |
| -1.460000000000075 | -0.623 | -0.898 | -0.994 |
| -1.455000000000076 | -0.622 | -0.897 | -0.994 |
| -1.450000000000076 | -0.62 | -0.896 | -0.994 |
| -1.445000000000076 | -0.618 | -0.895 | -0.994 |
| -1.440000000000076 | -0.617 | -0.894 | -0.994 |
| -1.435000000000076 | -0.615 | -0.893 | -0.994 |
| -1.430000000000076 | -0.614 | -0.892 | -0.993 |
| -1.425000000000076 | -0.612 | -0.891 | -0.993 |
| -1.420000000000076 | -0.611 | -0.89 | -0.993 |
| -1.415000000000076 | -0.609 | -0.889 | -0.993 |
| -1.410000000000077 | -0.608 | -0.887 | -0.993 |
| -1.405000000000077 | -0.606 | -0.886 | -0.993 |
| -1.400000000000077 | -0.604 | -0.885 | -0.993 |
| -1.395000000000077 | -0.603 | -0.884 | -0.992 |
| -1.390000000000077 | -0.601 | -0.883 | -0.992 |
| -1.385000000000077 | -0.6 | -0.882 | -0.992 |
| -1.380000000000077 | -0.598 | -0.881 | -0.992 |
| -1.375000000000077 | -0.596 | -0.88 | -0.992 |
| -1.370000000000077 | -0.595 | -0.879 | -0.992 |
| -1.365000000000077 | -0.593 | -0.878 | -0.992 |
| -1.360000000000078 | -0.592 | -0.876 | -0.991 |
| -1.355000000000078 | -0.59 | -0.875 | -0.991 |
| -1.350000000000078 | -0.588 | -0.874 | -0.991 |
| -1.345000000000078 | -0.587 | -0.873 | -0.991 |
| -1.340000000000078 | -0.585 | -0.872 | -0.991 |
| -1.335000000000078 | -0.583 | -0.87 | -0.99 |
| -1.330000000000078 | -0.582 | -0.869 | -0.99 |
| -1.325000000000078 | -0.58 | -0.868 | -0.99 |
| -1.320000000000078 | -0.578 | -0.867 | -0.99 |
| -1.315000000000079 | -0.577 | -0.866 | -0.99 |
| -1.310000000000079 | -0.575 | -0.864 | -0.989 |
| -1.305000000000079 | -0.573 | -0.863 | -0.989 |
| -1.300000000000079 | -0.572 | -0.862 | -0.989 |
| -1.295000000000079 | -0.57 | -0.86 | -0.989 |
| -1.29000000000008 | -0.568 | -0.859 | -0.989 |
| -1.285000000000079 | -0.567 | -0.858 | -0.988 |
| -1.280000000000079 | -0.565 | -0.856 | -0.988 |
| -1.275000000000079 | -0.563 | -0.855 | -0.988 |
| -1.270000000000079 | -0.561 | -0.854 | -0.988 |
| -1.26500000000008 | -0.56 | -0.852 | -0.987 |
| -1.26000000000008 | -0.558 | -0.851 | -0.987 |
| -1.25500000000008 | -0.556 | -0.85 | -0.987 |
| -1.25000000000008 | -0.555 | -0.848 | -0.987 |
| -1.24500000000008 | -0.553 | -0.847 | -0.986 |
| -1.24000000000008 | -0.551 | -0.845 | -0.986 |
| -1.23500000000008 | -0.549 | -0.844 | -0.986 |
| -1.23000000000008 | -0.548 | -0.843 | -0.986 |
| -1.22500000000008 | -0.546 | -0.841 | -0.985 |
| -1.220000000000081 | -0.544 | -0.84 | -0.985 |
| -1.215000000000081 | -0.542 | -0.838 | -0.985 |
| -1.210000000000081 | -0.541 | -0.837 | -0.984 |
| -1.205000000000081 | -0.539 | -0.835 | -0.984 |
| -1.200000000000081 | -0.537 | -0.834 | -0.984 |
| -1.195000000000081 | -0.535 | -0.832 | -0.983 |
| -1.190000000000081 | -0.533 | -0.831 | -0.983 |
| -1.185000000000081 | -0.532 | -0.829 | -0.983 |
| -1.180000000000081 | -0.53 | -0.827 | -0.982 |
| -1.175000000000082 | -0.528 | -0.826 | -0.982 |
| -1.170000000000082 | -0.526 | -0.824 | -0.982 |
| -1.165000000000082 | -0.524 | -0.823 | -0.981 |
| -1.160000000000082 | -0.523 | -0.821 | -0.981 |
| -1.155000000000082 | -0.521 | -0.819 | -0.98 |
| -1.150000000000082 | -0.519 | -0.818 | -0.98 |
| -1.145000000000082 | -0.517 | -0.816 | -0.98 |
| -1.140000000000082 | -0.515 | -0.814 | -0.979 |
| -1.135000000000082 | -0.514 | -0.813 | -0.979 |
| -1.130000000000082 | -0.512 | -0.811 | -0.978 |
| -1.125000000000083 | -0.51 | -0.809 | -0.978 |
| -1.120000000000083 | -0.508 | -0.808 | -0.978 |
| -1.115000000000083 | -0.506 | -0.806 | -0.977 |
| -1.110000000000083 | -0.504 | -0.804 | -0.977 |
| -1.105000000000083 | -0.502 | -0.802 | -0.976 |
| -1.100000000000083 | -0.501 | -0.8 | -0.976 |
| -1.095000000000083 | -0.499 | -0.799 | -0.975 |
| -1.090000000000083 | -0.497 | -0.797 | -0.975 |
| -1.085000000000083 | -0.495 | -0.795 | -0.974 |
| -1.080000000000084 | -0.493 | -0.793 | -0.974 |
| -1.075000000000084 | -0.491 | -0.791 | -0.973 |
| -1.070000000000084 | -0.489 | -0.789 | -0.973 |
| -1.065000000000084 | -0.487 | -0.788 | -0.972 |
| -1.060000000000084 | -0.485 | -0.786 | -0.972 |
| -1.055000000000084 | -0.483 | -0.784 | -0.971 |
| -1.050000000000084 | -0.482 | -0.782 | -0.97 |
| -1.045000000000084 | -0.48 | -0.78 | -0.97 |
| -1.040000000000084 | -0.478 | -0.778 | -0.969 |
| -1.035000000000085 | -0.476 | -0.776 | -0.969 |
| -1.030000000000085 | -0.474 | -0.774 | -0.968 |
| -1.025000000000085 | -0.472 | -0.772 | -0.967 |
| -1.020000000000085 | -0.47 | -0.77 | -0.967 |
| -1.015000000000085 | -0.468 | -0.768 | -0.966 |
| -1.010000000000085 | -0.466 | -0.766 | -0.965 |
| -1.005000000000085 | -0.464 | -0.764 | -0.965 |
| -1.000000000000085 | -0.462 | -0.762 | -0.964 |
| -0.995000000000085 | -0.46 | -0.759 | -0.963 |
| -0.990000000000085 | -0.458 | -0.757 | -0.963 |
| -0.985000000000085 | -0.456 | -0.755 | -0.962 |
| -0.980000000000085 | -0.454 | -0.753 | -0.961 |
| -0.975000000000085 | -0.452 | -0.751 | -0.96 |
| -0.970000000000085 | -0.45 | -0.749 | -0.96 |
| -0.965000000000085 | -0.448 | -0.746 | -0.959 |
| -0.960000000000085 | -0.446 | -0.744 | -0.958 |
| -0.955000000000085 | -0.444 | -0.742 | -0.957 |
| -0.950000000000085 | -0.442 | -0.74 | -0.956 |
| -0.945000000000085 | -0.44 | -0.738 | -0.955 |
| -0.940000000000085 | -0.438 | -0.735 | -0.954 |
| -0.935000000000085 | -0.436 | -0.733 | -0.954 |
| -0.930000000000085 | -0.434 | -0.731 | -0.953 |
| -0.925000000000085 | -0.432 | -0.728 | -0.952 |
| -0.920000000000085 | -0.43 | -0.726 | -0.951 |
| -0.915000000000085 | -0.428 | -0.724 | -0.95 |
| -0.910000000000085 | -0.426 | -0.721 | -0.949 |
| -0.905000000000085 | -0.424 | -0.719 | -0.948 |
| -0.900000000000085 | -0.422 | -0.716 | -0.947 |
| -0.895000000000085 | -0.42 | -0.714 | -0.946 |
| -0.890000000000085 | -0.418 | -0.711 | -0.945 |
| -0.885000000000085 | -0.416 | -0.709 | -0.944 |
| -0.880000000000085 | -0.414 | -0.706 | -0.943 |
| -0.875000000000085 | -0.412 | -0.704 | -0.941 |
| -0.870000000000085 | -0.409 | -0.701 | -0.94 |
| -0.865000000000085 | -0.407 | -0.699 | -0.939 |
| -0.860000000000085 | -0.405 | -0.696 | -0.938 |
| -0.855000000000085 | -0.403 | -0.694 | -0.937 |
| -0.850000000000085 | -0.401 | -0.691 | -0.935 |
| -0.845000000000085 | -0.399 | -0.688 | -0.934 |
| -0.840000000000085 | -0.397 | -0.686 | -0.933 |
| -0.835000000000085 | -0.395 | -0.683 | -0.932 |
| -0.830000000000085 | -0.393 | -0.68 | -0.93 |
| -0.825000000000085 | -0.391 | -0.678 | -0.929 |
| -0.820000000000085 | -0.388 | -0.675 | -0.927 |
| -0.815000000000085 | -0.386 | -0.672 | -0.926 |
| -0.810000000000085 | -0.384 | -0.67 | -0.925 |
| -0.805000000000085 | -0.382 | -0.667 | -0.923 |
| -0.800000000000085 | -0.38 | -0.664 | -0.922 |
| -0.795000000000085 | -0.378 | -0.661 | -0.92 |
| -0.790000000000085 | -0.376 | -0.658 | -0.919 |
| -0.785000000000085 | -0.374 | -0.656 | -0.917 |
| -0.780000000000085 | -0.371 | -0.653 | -0.915 |
| -0.775000000000085 | -0.369 | -0.65 | -0.914 |
| -0.770000000000085 | -0.367 | -0.647 | -0.912 |
| -0.765000000000085 | -0.365 | -0.644 | -0.91 |
| -0.760000000000085 | -0.363 | -0.641 | -0.909 |
| -0.755000000000085 | -0.361 | -0.638 | -0.907 |
| -0.750000000000085 | -0.358 | -0.635 | -0.905 |
| -0.745000000000085 | -0.356 | -0.632 | -0.903 |
| -0.740000000000085 | -0.354 | -0.629 | -0.901 |
| -0.735000000000085 | -0.352 | -0.626 | -0.9 |
| -0.730000000000085 | -0.35 | -0.623 | -0.898 |
| -0.725000000000085 | -0.347 | -0.62 | -0.896 |
| -0.720000000000085 | -0.345 | -0.617 | -0.894 |
| -0.715000000000085 | -0.343 | -0.614 | -0.892 |
| -0.710000000000085 | -0.341 | -0.611 | -0.89 |
| -0.705000000000085 | -0.339 | -0.608 | -0.887 |
| -0.700000000000085 | -0.336 | -0.604 | -0.885 |
| -0.695000000000085 | -0.334 | -0.601 | -0.883 |
| -0.690000000000085 | -0.332 | -0.598 | -0.881 |
| -0.685000000000085 | -0.33 | -0.595 | -0.879 |
| -0.680000000000085 | -0.327 | -0.592 | -0.876 |
| -0.675000000000085 | -0.325 | -0.588 | -0.874 |
| -0.670000000000085 | -0.323 | -0.585 | -0.872 |
| -0.665000000000085 | -0.321 | -0.582 | -0.869 |
| -0.660000000000085 | -0.319 | -0.578 | -0.867 |
| -0.655000000000085 | -0.316 | -0.575 | -0.864 |
| -0.650000000000085 | -0.314 | -0.572 | -0.862 |
| -0.645000000000085 | -0.312 | -0.568 | -0.859 |
| -0.640000000000085 | -0.31 | -0.565 | -0.856 |
| -0.635000000000085 | -0.307 | -0.561 | -0.854 |
| -0.630000000000085 | -0.305 | -0.558 | -0.851 |
| -0.625000000000085 | -0.303 | -0.555 | -0.848 |
| -0.620000000000085 | -0.3 | -0.551 | -0.845 |
| -0.615000000000085 | -0.298 | -0.548 | -0.843 |
| -0.610000000000085 | -0.296 | -0.544 | -0.84 |
| -0.605000000000085 | -0.294 | -0.541 | -0.837 |
| -0.600000000000085 | -0.291 | -0.537 | -0.834 |
| -0.595000000000085 | -0.289 | -0.533 | -0.831 |
| -0.590000000000085 | -0.287 | -0.53 | -0.827 |
| -0.585000000000085 | -0.284 | -0.526 | -0.824 |
| -0.580000000000085 | -0.282 | -0.523 | -0.821 |
| -0.575000000000085 | -0.28 | -0.519 | -0.818 |
| -0.570000000000085 | -0.278 | -0.515 | -0.814 |
| -0.565000000000085 | -0.275 | -0.512 | -0.811 |
| -0.560000000000085 | -0.273 | -0.508 | -0.808 |
| -0.555000000000085 | -0.271 | -0.504 | -0.804 |
| -0.550000000000085 | -0.268 | -0.501 | -0.8 |
| -0.545000000000085 | -0.266 | -0.497 | -0.797 |
| -0.540000000000085 | -0.264 | -0.493 | -0.793 |
| -0.535000000000085 | -0.261 | -0.489 | -0.789 |
| -0.530000000000085 | -0.259 | -0.485 | -0.786 |
| -0.525000000000085 | -0.257 | -0.482 | -0.782 |
| -0.520000000000085 | -0.254 | -0.478 | -0.778 |
| -0.515000000000085 | -0.252 | -0.474 | -0.774 |
| -0.510000000000085 | -0.25 | -0.47 | -0.77 |
| -0.505000000000085 | -0.247 | -0.466 | -0.766 |
| -0.500000000000085 | -0.245 | -0.462 | -0.762 |
| -0.495000000000085 | -0.243 | -0.458 | -0.757 |
| -0.490000000000085 | -0.24 | -0.454 | -0.753 |
| -0.485000000000085 | -0.238 | -0.45 | -0.749 |
| -0.480000000000085 | -0.235 | -0.446 | -0.744 |
| -0.475000000000085 | -0.233 | -0.442 | -0.74 |
| -0.470000000000085 | -0.231 | -0.438 | -0.735 |
| -0.465000000000085 | -0.228 | -0.434 | -0.731 |
| -0.460000000000085 | -0.226 | -0.43 | -0.726 |
| -0.455000000000085 | -0.224 | -0.426 | -0.721 |
| -0.450000000000085 | -0.221 | -0.422 | -0.716 |
| -0.445000000000085 | -0.219 | -0.418 | -0.711 |
| -0.440000000000085 | -0.217 | -0.414 | -0.706 |
| -0.435000000000085 | -0.214 | -0.409 | -0.701 |
| -0.430000000000085 | -0.212 | -0.405 | -0.696 |
| -0.425000000000085 | -0.209 | -0.401 | -0.691 |
| -0.420000000000085 | -0.207 | -0.397 | -0.686 |
| -0.415000000000085 | -0.205 | -0.393 | -0.68 |
| -0.410000000000085 | -0.202 | -0.388 | -0.675 |
| -0.405000000000085 | -0.2 | -0.384 | -0.67 |
| -0.400000000000085 | -0.197 | -0.38 | -0.664 |
| -0.395000000000085 | -0.195 | -0.376 | -0.658 |
| -0.390000000000085 | -0.193 | -0.371 | -0.653 |
| -0.385000000000085 | -0.19 | -0.367 | -0.647 |
| -0.380000000000085 | -0.188 | -0.363 | -0.641 |
| -0.375000000000085 | -0.185 | -0.358 | -0.635 |
| -0.370000000000085 | -0.183 | -0.354 | -0.629 |
| -0.365000000000085 | -0.181 | -0.35 | -0.623 |
| -0.360000000000085 | -0.178 | -0.345 | -0.617 |
| -0.355000000000085 | -0.176 | -0.341 | -0.611 |
| -0.350000000000085 | -0.173 | -0.336 | -0.604 |
| -0.345000000000085 | -0.171 | -0.332 | -0.598 |
| -0.340000000000085 | -0.168 | -0.327 | -0.592 |
| -0.335000000000085 | -0.166 | -0.323 | -0.585 |
| -0.330000000000085 | -0.164 | -0.319 | -0.578 |
| -0.325000000000085 | -0.161 | -0.314 | -0.572 |
| -0.320000000000085 | -0.159 | -0.31 | -0.565 |
| -0.315000000000085 | -0.156 | -0.305 | -0.558 |
| -0.310000000000085 | -0.154 | -0.3 | -0.551 |
| -0.305000000000085 | -0.151 | -0.296 | -0.544 |
| -0.300000000000085 | -0.149 | -0.291 | -0.537 |
| -0.295000000000085 | -0.146 | -0.287 | -0.53 |
| -0.290000000000085 | -0.144 | -0.282 | -0.523 |
| -0.285000000000085 | -0.142 | -0.278 | -0.515 |
| -0.280000000000085 | -0.139 | -0.273 | -0.508 |
| -0.275000000000085 | -0.137 | -0.268 | -0.501 |
| -0.270000000000085 | -0.134 | -0.264 | -0.493 |
| -0.265000000000085 | -0.132 | -0.259 | -0.485 |
| -0.260000000000085 | -0.129 | -0.254 | -0.478 |
| -0.255000000000085 | -0.127 | -0.25 | -0.47 |
| -0.250000000000085 | -0.124 | -0.245 | -0.462 |
| -0.245000000000085 | -0.122 | -0.24 | -0.454 |
| -0.240000000000085 | -0.119 | -0.235 | -0.446 |
| -0.235000000000085 | -0.117 | -0.231 | -0.438 |
| -0.230000000000085 | -0.114 | -0.226 | -0.43 |
| -0.225000000000085 | -0.112 | -0.221 | -0.422 |
| -0.220000000000085 | -0.11 | -0.217 | -0.414 |
| -0.215000000000085 | -0.107 | -0.212 | -0.405 |
| -0.210000000000085 | -0.105 | -0.207 | -0.397 |
| -0.205000000000085 | -0.102 | -0.202 | -0.388 |
| -0.200000000000085 | -0.1 | -0.197 | -0.38 |
| -0.195000000000085 | -0.097 | -0.193 | -0.371 |
| -0.190000000000085 | -0.095 | -0.188 | -0.363 |
| -0.185000000000085 | -0.092 | -0.183 | -0.354 |
| -0.180000000000085 | -0.09 | -0.178 | -0.345 |
| -0.175000000000085 | -0.087 | -0.173 | -0.336 |
| -0.170000000000085 | -0.085 | -0.168 | -0.327 |
| -0.165000000000085 | -0.082 | -0.164 | -0.319 |
| -0.160000000000085 | -0.08 | -0.159 | -0.31 |
| -0.155000000000084 | -0.077 | -0.154 | -0.3 |
| -0.150000000000084 | -0.075 | -0.149 | -0.291 |
| -0.145000000000084 | -0.072 | -0.144 | -0.282 |
| -0.140000000000084 | -0.07 | -0.139 | -0.273 |
| -0.135000000000084 | -0.067 | -0.134 | -0.264 |
| -0.130000000000084 | -0.065 | -0.129 | -0.254 |
| -0.125000000000084 | -0.062 | -0.124 | -0.245 |
| -0.120000000000084 | -0.06 | -0.119 | -0.235 |
| -0.115000000000084 | -0.057 | -0.114 | -0.226 |
| -0.110000000000084 | -0.055 | -0.11 | -0.217 |
| -0.105000000000084 | -0.052 | -0.105 | -0.207 |
| -0.100000000000084 | -0.05 | -0.1 | -0.197 |
| -0.0950000000000844 | -0.047 | -0.095 | -0.188 |
| -0.0900000000000844 | -0.045 | -0.09 | -0.178 |
| -0.0850000000000844 | -0.042 | -0.085 | -0.168 |
| -0.0800000000000844 | -0.04 | -0.08 | -0.159 |
| -0.0750000000000844 | -0.037 | -0.075 | -0.149 |
| -0.0700000000000844 | -0.035 | -0.07 | -0.139 |
| -0.0650000000000844 | -0.032 | -0.065 | -0.129 |
| -0.0600000000000844 | -0.03 | -0.06 | -0.119 |
| -0.0550000000000844 | -0.027 | -0.055 | -0.11 |
| -0.0500000000000844 | -0.025 | -0.05 | -0.1 |
| -0.0450000000000844 | -0.022 | -0.045 | -0.09 |
| -0.0400000000000844 | -0.02 | -0.04 | -0.08 |
| -0.0350000000000844 | -0.017 | -0.035 | -0.07 |
| -0.0300000000000844 | -0.015 | -0.03 | -0.06 |
| -0.0250000000000844 | -0.012 | -0.025 | -0.05 |
| -0.0200000000000844 | -0.01 | -0.02 | -0.04 |
| -0.0150000000000844 | -0.007 | -0.015 | -0.03 |
| -0.0100000000000844 | -0.005 | -0.01 | -0.02 |
| -0.00500000000008444 | -0.002 | -0.005 | -0.01 |
| -8.4444604087075e-14 | 0 | 0 | 0 |
| 0.00499999999991555 | 0.002 | 0.005 | 0.01 |
| 0.00999999999991555 | 0.005 | 0.01 | 0.02 |
| 0.0149999999999156 | 0.007 | 0.015 | 0.03 |
| 0.0199999999999156 | 0.01 | 0.02 | 0.04 |
| 0.0249999999999156 | 0.012 | 0.025 | 0.05 |
| 0.0299999999999156 | 0.015 | 0.03 | 0.06 |
| 0.0349999999999155 | 0.017 | 0.035 | 0.07 |
| 0.0399999999999155 | 0.02 | 0.04 | 0.08 |
| 0.0449999999999155 | 0.022 | 0.045 | 0.09 |
| 0.0499999999999155 | 0.025 | 0.05 | 0.1 |
| 0.0549999999999155 | 0.027 | 0.055 | 0.11 |
| 0.0599999999999155 | 0.03 | 0.06 | 0.119 |
| 0.0649999999999155 | 0.032 | 0.065 | 0.129 |
| 0.0699999999999155 | 0.035 | 0.07 | 0.139 |
| 0.0749999999999155 | 0.037 | 0.075 | 0.149 |
| 0.0799999999999155 | 0.04 | 0.08 | 0.159 |
| 0.0849999999999155 | 0.042 | 0.085 | 0.168 |
| 0.0899999999999155 | 0.045 | 0.09 | 0.178 |
| 0.0949999999999155 | 0.047 | 0.095 | 0.188 |
| 0.0999999999999155 | 0.05 | 0.1 | 0.197 |
| 0.104999999999916 | 0.052 | 0.105 | 0.207 |
| 0.109999999999916 | 0.055 | 0.11 | 0.217 |
| 0.114999999999916 | 0.057 | 0.114 | 0.226 |
| 0.119999999999916 | 0.06 | 0.119 | 0.235 |
| 0.124999999999916 | 0.062 | 0.124 | 0.245 |
| 0.129999999999916 | 0.065 | 0.129 | 0.254 |
| 0.134999999999916 | 0.067 | 0.134 | 0.264 |
| 0.139999999999916 | 0.07 | 0.139 | 0.273 |
| 0.144999999999916 | 0.072 | 0.144 | 0.282 |
| 0.149999999999916 | 0.075 | 0.149 | 0.291 |
| 0.154999999999916 | 0.077 | 0.154 | 0.3 |
| 0.159999999999916 | 0.08 | 0.159 | 0.31 |
| 0.164999999999916 | 0.082 | 0.164 | 0.319 |
| 0.169999999999916 | 0.085 | 0.168 | 0.327 |
| 0.174999999999916 | 0.087 | 0.173 | 0.336 |
| 0.179999999999916 | 0.09 | 0.178 | 0.345 |
| 0.184999999999916 | 0.092 | 0.183 | 0.354 |
| 0.189999999999916 | 0.095 | 0.188 | 0.363 |
| 0.194999999999916 | 0.097 | 0.193 | 0.371 |
| 0.199999999999916 | 0.1 | 0.197 | 0.38 |
| 0.204999999999916 | 0.102 | 0.202 | 0.388 |
| 0.209999999999916 | 0.105 | 0.207 | 0.397 |
| 0.214999999999916 | 0.107 | 0.212 | 0.405 |
| 0.219999999999916 | 0.11 | 0.217 | 0.414 |
| 0.224999999999916 | 0.112 | 0.221 | 0.422 |
| 0.229999999999916 | 0.114 | 0.226 | 0.43 |
| 0.234999999999916 | 0.117 | 0.231 | 0.438 |
| 0.239999999999916 | 0.119 | 0.235 | 0.446 |
| 0.244999999999916 | 0.122 | 0.24 | 0.454 |
| 0.249999999999916 | 0.124 | 0.245 | 0.462 |
| 0.254999999999916 | 0.127 | 0.25 | 0.47 |
| 0.259999999999916 | 0.129 | 0.254 | 0.478 |
| 0.264999999999916 | 0.132 | 0.259 | 0.485 |
| 0.269999999999916 | 0.134 | 0.264 | 0.493 |
| 0.274999999999916 | 0.137 | 0.268 | 0.501 |
| 0.279999999999916 | 0.139 | 0.273 | 0.508 |
| 0.284999999999916 | 0.142 | 0.278 | 0.515 |
| 0.289999999999916 | 0.144 | 0.282 | 0.523 |
| 0.294999999999916 | 0.146 | 0.287 | 0.53 |
| 0.299999999999916 | 0.149 | 0.291 | 0.537 |
| 0.304999999999916 | 0.151 | 0.296 | 0.544 |
| 0.309999999999916 | 0.154 | 0.3 | 0.551 |
| 0.314999999999916 | 0.156 | 0.305 | 0.558 |
| 0.319999999999916 | 0.159 | 0.31 | 0.565 |
| 0.324999999999916 | 0.161 | 0.314 | 0.572 |
| 0.329999999999916 | 0.164 | 0.319 | 0.578 |
| 0.334999999999916 | 0.166 | 0.323 | 0.585 |
| 0.339999999999916 | 0.168 | 0.327 | 0.592 |
| 0.344999999999916 | 0.171 | 0.332 | 0.598 |
| 0.349999999999916 | 0.173 | 0.336 | 0.604 |
| 0.354999999999916 | 0.176 | 0.341 | 0.611 |
| 0.359999999999916 | 0.178 | 0.345 | 0.617 |
| 0.364999999999916 | 0.181 | 0.35 | 0.623 |
| 0.369999999999916 | 0.183 | 0.354 | 0.629 |
| 0.374999999999916 | 0.185 | 0.358 | 0.635 |
| 0.379999999999916 | 0.188 | 0.363 | 0.641 |
| 0.384999999999916 | 0.19 | 0.367 | 0.647 |
| 0.389999999999916 | 0.193 | 0.371 | 0.653 |
| 0.394999999999916 | 0.195 | 0.376 | 0.658 |
| 0.399999999999916 | 0.197 | 0.38 | 0.664 |
| 0.404999999999916 | 0.2 | 0.384 | 0.67 |
| 0.409999999999916 | 0.202 | 0.388 | 0.675 |
| 0.414999999999916 | 0.205 | 0.393 | 0.68 |
| 0.419999999999916 | 0.207 | 0.397 | 0.686 |
| 0.424999999999916 | 0.209 | 0.401 | 0.691 |
| 0.429999999999916 | 0.212 | 0.405 | 0.696 |
| 0.434999999999916 | 0.214 | 0.409 | 0.701 |
| 0.439999999999916 | 0.217 | 0.414 | 0.706 |
| 0.444999999999916 | 0.219 | 0.418 | 0.711 |
| 0.449999999999916 | 0.221 | 0.422 | 0.716 |
| 0.454999999999916 | 0.224 | 0.426 | 0.721 |
| 0.459999999999916 | 0.226 | 0.43 | 0.726 |
| 0.464999999999916 | 0.228 | 0.434 | 0.731 |
| 0.469999999999916 | 0.231 | 0.438 | 0.735 |
| 0.474999999999916 | 0.233 | 0.442 | 0.74 |
| 0.479999999999916 | 0.235 | 0.446 | 0.744 |
| 0.484999999999916 | 0.238 | 0.45 | 0.749 |
| 0.489999999999916 | 0.24 | 0.454 | 0.753 |
| 0.494999999999916 | 0.243 | 0.458 | 0.757 |
| 0.499999999999916 | 0.245 | 0.462 | 0.762 |
| 0.504999999999916 | 0.247 | 0.466 | 0.766 |
| 0.509999999999916 | 0.25 | 0.47 | 0.77 |
| 0.514999999999916 | 0.252 | 0.474 | 0.774 |
| 0.519999999999916 | 0.254 | 0.478 | 0.778 |
| 0.524999999999916 | 0.257 | 0.482 | 0.782 |
| 0.529999999999916 | 0.259 | 0.485 | 0.786 |
| 0.534999999999916 | 0.261 | 0.489 | 0.789 |
| 0.539999999999916 | 0.264 | 0.493 | 0.793 |
| 0.544999999999916 | 0.266 | 0.497 | 0.797 |
| 0.549999999999916 | 0.268 | 0.501 | 0.8 |
| 0.554999999999916 | 0.271 | 0.504 | 0.804 |
| 0.559999999999916 | 0.273 | 0.508 | 0.808 |
| 0.564999999999916 | 0.275 | 0.512 | 0.811 |
| 0.569999999999916 | 0.278 | 0.515 | 0.814 |
| 0.574999999999916 | 0.28 | 0.519 | 0.818 |
| 0.579999999999916 | 0.282 | 0.523 | 0.821 |
| 0.584999999999916 | 0.284 | 0.526 | 0.824 |
| 0.589999999999916 | 0.287 | 0.53 | 0.827 |
| 0.594999999999916 | 0.289 | 0.533 | 0.831 |
| 0.599999999999916 | 0.291 | 0.537 | 0.834 |
| 0.604999999999916 | 0.294 | 0.541 | 0.837 |
| 0.609999999999916 | 0.296 | 0.544 | 0.84 |
| 0.614999999999916 | 0.298 | 0.548 | 0.843 |
| 0.619999999999916 | 0.3 | 0.551 | 0.845 |
| 0.624999999999916 | 0.303 | 0.555 | 0.848 |
| 0.629999999999916 | 0.305 | 0.558 | 0.851 |
| 0.634999999999916 | 0.307 | 0.561 | 0.854 |
| 0.639999999999916 | 0.31 | 0.565 | 0.856 |
| 0.644999999999916 | 0.312 | 0.568 | 0.859 |
| 0.649999999999916 | 0.314 | 0.572 | 0.862 |
| 0.654999999999916 | 0.316 | 0.575 | 0.864 |
| 0.659999999999916 | 0.319 | 0.578 | 0.867 |
| 0.664999999999916 | 0.321 | 0.582 | 0.869 |
| 0.669999999999916 | 0.323 | 0.585 | 0.872 |
| 0.674999999999916 | 0.325 | 0.588 | 0.874 |
| 0.679999999999916 | 0.327 | 0.592 | 0.876 |
| 0.684999999999916 | 0.33 | 0.595 | 0.879 |
| 0.689999999999916 | 0.332 | 0.598 | 0.881 |
| 0.694999999999916 | 0.334 | 0.601 | 0.883 |
| 0.699999999999916 | 0.336 | 0.604 | 0.885 |
| 0.704999999999916 | 0.339 | 0.608 | 0.887 |
| 0.709999999999916 | 0.341 | 0.611 | 0.89 |
| 0.714999999999916 | 0.343 | 0.614 | 0.892 |
| 0.719999999999916 | 0.345 | 0.617 | 0.894 |
| 0.724999999999916 | 0.347 | 0.62 | 0.896 |
| 0.729999999999916 | 0.35 | 0.623 | 0.898 |
| 0.734999999999916 | 0.352 | 0.626 | 0.9 |
| 0.739999999999916 | 0.354 | 0.629 | 0.901 |
| 0.744999999999916 | 0.356 | 0.632 | 0.903 |
| 0.749999999999916 | 0.358 | 0.635 | 0.905 |
| 0.754999999999916 | 0.361 | 0.638 | 0.907 |
| 0.759999999999916 | 0.363 | 0.641 | 0.909 |
| 0.764999999999916 | 0.365 | 0.644 | 0.91 |
| 0.769999999999916 | 0.367 | 0.647 | 0.912 |
| 0.774999999999916 | 0.369 | 0.65 | 0.914 |
| 0.779999999999916 | 0.371 | 0.653 | 0.915 |
| 0.784999999999916 | 0.374 | 0.656 | 0.917 |
| 0.789999999999916 | 0.376 | 0.658 | 0.919 |
| 0.794999999999916 | 0.378 | 0.661 | 0.92 |
| 0.799999999999916 | 0.38 | 0.664 | 0.922 |
| 0.804999999999916 | 0.382 | 0.667 | 0.923 |
| 0.809999999999916 | 0.384 | 0.67 | 0.925 |
| 0.814999999999916 | 0.386 | 0.672 | 0.926 |
| 0.819999999999916 | 0.388 | 0.675 | 0.927 |
| 0.824999999999916 | 0.391 | 0.678 | 0.929 |
| 0.829999999999916 | 0.393 | 0.68 | 0.93 |
| 0.834999999999916 | 0.395 | 0.683 | 0.932 |
| 0.839999999999916 | 0.397 | 0.686 | 0.933 |
| 0.844999999999916 | 0.399 | 0.688 | 0.934 |
| 0.849999999999916 | 0.401 | 0.691 | 0.935 |
| 0.854999999999916 | 0.403 | 0.694 | 0.937 |
| 0.859999999999916 | 0.405 | 0.696 | 0.938 |
| 0.864999999999916 | 0.407 | 0.699 | 0.939 |
| 0.869999999999916 | 0.409 | 0.701 | 0.94 |
| 0.874999999999916 | 0.412 | 0.704 | 0.941 |
| 0.879999999999916 | 0.414 | 0.706 | 0.943 |
| 0.884999999999916 | 0.416 | 0.709 | 0.944 |
| 0.889999999999916 | 0.418 | 0.711 | 0.945 |
| 0.894999999999916 | 0.42 | 0.714 | 0.946 |
| 0.899999999999916 | 0.422 | 0.716 | 0.947 |
| 0.904999999999916 | 0.424 | 0.719 | 0.948 |
| 0.909999999999916 | 0.426 | 0.721 | 0.949 |
| 0.914999999999916 | 0.428 | 0.724 | 0.95 |
| 0.919999999999916 | 0.43 | 0.726 | 0.951 |
| 0.924999999999916 | 0.432 | 0.728 | 0.952 |
| 0.929999999999916 | 0.434 | 0.731 | 0.953 |
| 0.934999999999916 | 0.436 | 0.733 | 0.954 |
| 0.939999999999916 | 0.438 | 0.735 | 0.954 |
| 0.944999999999916 | 0.44 | 0.738 | 0.955 |
| 0.949999999999916 | 0.442 | 0.74 | 0.956 |
| 0.954999999999916 | 0.444 | 0.742 | 0.957 |
| 0.959999999999916 | 0.446 | 0.744 | 0.958 |
| 0.964999999999916 | 0.448 | 0.746 | 0.959 |
| 0.969999999999916 | 0.45 | 0.749 | 0.96 |
| 0.974999999999916 | 0.452 | 0.751 | 0.96 |
| 0.979999999999916 | 0.454 | 0.753 | 0.961 |
| 0.984999999999916 | 0.456 | 0.755 | 0.962 |
| 0.989999999999916 | 0.458 | 0.757 | 0.963 |
| 0.994999999999916 | 0.46 | 0.759 | 0.963 |
| 0.999999999999916 | 0.462 | 0.762 | 0.964 |
| 1.004999999999916 | 0.464 | 0.764 | 0.965 |
| 1.009999999999916 | 0.466 | 0.766 | 0.965 |
| 1.014999999999916 | 0.468 | 0.768 | 0.966 |
| 1.019999999999916 | 0.47 | 0.77 | 0.967 |
| 1.024999999999916 | 0.472 | 0.772 | 0.967 |
| 1.029999999999916 | 0.474 | 0.774 | 0.968 |
| 1.034999999999916 | 0.476 | 0.776 | 0.969 |
| 1.039999999999915 | 0.478 | 0.778 | 0.969 |
| 1.044999999999915 | 0.48 | 0.78 | 0.97 |
| 1.049999999999915 | 0.482 | 0.782 | 0.97 |
| 1.054999999999915 | 0.483 | 0.784 | 0.971 |
| 1.059999999999915 | 0.485 | 0.786 | 0.972 |
| 1.064999999999915 | 0.487 | 0.788 | 0.972 |
| 1.069999999999915 | 0.489 | 0.789 | 0.973 |
| 1.074999999999915 | 0.491 | 0.791 | 0.973 |
| 1.079999999999915 | 0.493 | 0.793 | 0.974 |
| 1.084999999999914 | 0.495 | 0.795 | 0.974 |
| 1.089999999999914 | 0.497 | 0.797 | 0.975 |
| 1.094999999999914 | 0.499 | 0.799 | 0.975 |
| 1.099999999999914 | 0.501 | 0.8 | 0.976 |
| 1.104999999999914 | 0.502 | 0.802 | 0.976 |
| 1.109999999999914 | 0.504 | 0.804 | 0.977 |
| 1.114999999999914 | 0.506 | 0.806 | 0.977 |
| 1.119999999999914 | 0.508 | 0.808 | 0.978 |
| 1.124999999999914 | 0.51 | 0.809 | 0.978 |
| 1.129999999999914 | 0.512 | 0.811 | 0.978 |
| 1.134999999999913 | 0.514 | 0.813 | 0.979 |
| 1.139999999999913 | 0.515 | 0.814 | 0.979 |
| 1.144999999999913 | 0.517 | 0.816 | 0.98 |
| 1.149999999999913 | 0.519 | 0.818 | 0.98 |
| 1.154999999999913 | 0.521 | 0.819 | 0.98 |
| 1.159999999999913 | 0.523 | 0.821 | 0.981 |
| 1.164999999999913 | 0.524 | 0.823 | 0.981 |
| 1.169999999999913 | 0.526 | 0.824 | 0.982 |
| 1.174999999999913 | 0.528 | 0.826 | 0.982 |
| 1.179999999999912 | 0.53 | 0.827 | 0.982 |
| 1.184999999999912 | 0.532 | 0.829 | 0.983 |
| 1.189999999999912 | 0.533 | 0.831 | 0.983 |
| 1.194999999999912 | 0.535 | 0.832 | 0.983 |
| 1.199999999999912 | 0.537 | 0.834 | 0.984 |
| 1.204999999999912 | 0.539 | 0.835 | 0.984 |
| 1.209999999999912 | 0.541 | 0.837 | 0.984 |
| 1.214999999999912 | 0.542 | 0.838 | 0.985 |
| 1.219999999999912 | 0.544 | 0.84 | 0.985 |
| 1.224999999999911 | 0.546 | 0.841 | 0.985 |
| 1.229999999999911 | 0.548 | 0.843 | 0.986 |
| 1.234999999999911 | 0.549 | 0.844 | 0.986 |
| 1.239999999999911 | 0.551 | 0.845 | 0.986 |
| 1.244999999999911 | 0.553 | 0.847 | 0.986 |
| 1.249999999999911 | 0.555 | 0.848 | 0.987 |
| 1.254999999999911 | 0.556 | 0.85 | 0.987 |
| 1.259999999999911 | 0.558 | 0.851 | 0.987 |
| 1.264999999999911 | 0.56 | 0.852 | 0.987 |
| 1.269999999999911 | 0.561 | 0.854 | 0.988 |
| 1.27499999999991 | 0.563 | 0.855 | 0.988 |
| 1.27999999999991 | 0.565 | 0.856 | 0.988 |
| 1.28499999999991 | 0.567 | 0.858 | 0.988 |
| 1.28999999999991 | 0.568 | 0.859 | 0.989 |
| 1.29499999999991 | 0.57 | 0.86 | 0.989 |
| 1.29999999999991 | 0.572 | 0.862 | 0.989 |
| 1.30499999999991 | 0.573 | 0.863 | 0.989 |
| 1.30999999999991 | 0.575 | 0.864 | 0.989 |
| 1.31499999999991 | 0.577 | 0.866 | 0.99 |
| 1.319999999999909 | 0.578 | 0.867 | 0.99 |
| 1.324999999999909 | 0.58 | 0.868 | 0.99 |
| 1.329999999999909 | 0.582 | 0.869 | 0.99 |
| 1.334999999999909 | 0.583 | 0.87 | 0.99 |
| 1.339999999999909 | 0.585 | 0.872 | 0.991 |
| 1.344999999999909 | 0.587 | 0.873 | 0.991 |
| 1.349999999999909 | 0.588 | 0.874 | 0.991 |
| 1.354999999999909 | 0.59 | 0.875 | 0.991 |
| 1.359999999999909 | 0.592 | 0.876 | 0.991 |
| 1.364999999999908 | 0.593 | 0.878 | 0.992 |
| 1.369999999999908 | 0.595 | 0.879 | 0.992 |
| 1.374999999999908 | 0.596 | 0.88 | 0.992 |
| 1.379999999999908 | 0.598 | 0.881 | 0.992 |
| 1.384999999999908 | 0.6 | 0.882 | 0.992 |
| 1.389999999999908 | 0.601 | 0.883 | 0.992 |
| 1.394999999999908 | 0.603 | 0.884 | 0.992 |
| 1.399999999999908 | 0.604 | 0.885 | 0.993 |
| 1.404999999999908 | 0.606 | 0.886 | 0.993 |
| 1.409999999999908 | 0.608 | 0.887 | 0.993 |
| 1.414999999999907 | 0.609 | 0.889 | 0.993 |
| 1.419999999999907 | 0.611 | 0.89 | 0.993 |
| 1.424999999999907 | 0.612 | 0.891 | 0.993 |
| 1.429999999999907 | 0.614 | 0.892 | 0.993 |
| 1.434999999999907 | 0.615 | 0.893 | 0.994 |
| 1.439999999999907 | 0.617 | 0.894 | 0.994 |
| 1.444999999999907 | 0.618 | 0.895 | 0.994 |
| 1.449999999999907 | 0.62 | 0.896 | 0.994 |
| 1.454999999999907 | 0.622 | 0.897 | 0.994 |
| 1.459999999999906 | 0.623 | 0.898 | 0.994 |
| 1.464999999999906 | 0.625 | 0.899 | 0.994 |
| 1.469999999999906 | 0.626 | 0.9 | 0.994 |
| 1.474999999999906 | 0.628 | 0.901 | 0.995 |
| 1.479999999999906 | 0.629 | 0.901 | 0.995 |
| 1.484999999999906 | 0.631 | 0.902 | 0.995 |
| 1.489999999999906 | 0.632 | 0.903 | 0.995 |
| 1.494999999999906 | 0.634 | 0.904 | 0.995 |
| 1.499999999999906 | 0.635 | 0.905 | 0.995 |
| 1.504999999999906 | 0.637 | 0.906 | 0.995 |
| 1.509999999999905 | 0.638 | 0.907 | 0.995 |
| 1.514999999999905 | 0.64 | 0.908 | 0.995 |
| 1.519999999999905 | 0.641 | 0.909 | 0.995 |
| 1.524999999999905 | 0.643 | 0.91 | 0.996 |
| 1.529999999999905 | 0.644 | 0.91 | 0.996 |
| 1.534999999999905 | 0.645 | 0.911 | 0.996 |
| 1.539999999999905 | 0.647 | 0.912 | 0.996 |
| 1.544999999999905 | 0.648 | 0.913 | 0.996 |
| 1.549999999999905 | 0.65 | 0.914 | 0.996 |
| 1.554999999999904 | 0.651 | 0.915 | 0.996 |
| 1.559999999999904 | 0.653 | 0.915 | 0.996 |
| 1.564999999999904 | 0.654 | 0.916 | 0.996 |
| 1.569999999999904 | 0.656 | 0.917 | 0.996 |
| 1.574999999999904 | 0.657 | 0.918 | 0.996 |
| 1.579999999999904 | 0.658 | 0.919 | 0.996 |
| 1.584999999999904 | 0.66 | 0.919 | 0.996 |
| 1.589999999999904 | 0.661 | 0.92 | 0.997 |
| 1.594999999999904 | 0.663 | 0.921 | 0.997 |
| 1.599999999999903 | 0.664 | 0.922 | 0.997 |
| 1.604999999999903 | 0.665 | 0.922 | 0.997 |
| 1.609999999999903 | 0.667 | 0.923 | 0.997 |
| 1.614999999999903 | 0.668 | 0.924 | 0.997 |
| 1.619999999999903 | 0.67 | 0.925 | 0.997 |
| 1.624999999999903 | 0.671 | 0.925 | 0.997 |
| 1.629999999999903 | 0.672 | 0.926 | 0.997 |
| 1.634999999999903 | 0.674 | 0.927 | 0.997 |
| 1.639999999999903 | 0.675 | 0.927 | 0.997 |
| 1.644999999999902 | 0.676 | 0.928 | 0.997 |
| 1.649999999999902 | 0.678 | 0.929 | 0.997 |
| 1.654999999999902 | 0.679 | 0.93 | 0.997 |
| 1.659999999999902 | 0.68 | 0.93 | 0.997 |
| 1.664999999999902 | 0.682 | 0.931 | 0.997 |
| 1.669999999999902 | 0.683 | 0.932 | 0.997 |
| 1.674999999999902 | 0.684 | 0.932 | 0.998 |
| 1.679999999999902 | 0.686 | 0.933 | 0.998 |
| 1.684999999999902 | 0.687 | 0.934 | 0.998 |
| 1.689999999999901 | 0.688 | 0.934 | 0.998 |
| 1.694999999999901 | 0.69 | 0.935 | 0.998 |
| 1.699999999999901 | 0.691 | 0.935 | 0.998 |
| 1.704999999999901 | 0.692 | 0.936 | 0.998 |
| 1.709999999999901 | 0.694 | 0.937 | 0.998 |
| 1.714999999999901 | 0.695 | 0.937 | 0.998 |
| 1.719999999999901 | 0.696 | 0.938 | 0.998 |
| 1.724999999999901 | 0.698 | 0.938 | 0.998 |
| 1.729999999999901 | 0.699 | 0.939 | 0.998 |
| 1.734999999999901 | 0.7 | 0.94 | 0.998 |
| 1.7399999999999 | 0.701 | 0.94 | 0.998 |
| 1.7449999999999 | 0.703 | 0.941 | 0.998 |
| 1.7499999999999 | 0.704 | 0.941 | 0.998 |
| 1.7549999999999 | 0.705 | 0.942 | 0.998 |
| 1.7599999999999 | 0.706 | 0.943 | 0.998 |
| 1.7649999999999 | 0.708 | 0.943 | 0.998 |
| 1.7699999999999 | 0.709 | 0.944 | 0.998 |
| 1.7749999999999 | 0.71 | 0.944 | 0.998 |
| 1.7799999999999 | 0.711 | 0.945 | 0.998 |
| 1.784999999999899 | 0.713 | 0.945 | 0.998 |
| 1.789999999999899 | 0.714 | 0.946 | 0.998 |
| 1.794999999999899 | 0.715 | 0.946 | 0.998 |
| 1.799999999999899 | 0.716 | 0.947 | 0.999 |
| 1.804999999999899 | 0.718 | 0.947 | 0.999 |
| 1.809999999999899 | 0.719 | 0.948 | 0.999 |
| 1.814999999999899 | 0.72 | 0.948 | 0.999 |
| 1.819999999999899 | 0.721 | 0.949 | 0.999 |
| 1.824999999999899 | 0.722 | 0.949 | 0.999 |
| 1.829999999999899 | 0.724 | 0.95 | 0.999 |
| 1.834999999999898 | 0.725 | 0.95 | 0.999 |
| 1.839999999999898 | 0.726 | 0.951 | 0.999 |
| 1.844999999999898 | 0.727 | 0.951 | 0.999 |
| 1.849999999999898 | 0.728 | 0.952 | 0.999 |
| 1.854999999999898 | 0.729 | 0.952 | 0.999 |
| 1.859999999999898 | 0.731 | 0.953 | 0.999 |
| 1.864999999999898 | 0.732 | 0.953 | 0.999 |
| 1.869999999999898 | 0.733 | 0.954 | 0.999 |
| 1.874999999999898 | 0.734 | 0.954 | 0.999 |
| 1.879999999999897 | 0.735 | 0.954 | 0.999 |
| 1.884999999999897 | 0.736 | 0.955 | 0.999 |
| 1.889999999999897 | 0.738 | 0.955 | 0.999 |
| 1.894999999999897 | 0.739 | 0.956 | 0.999 |
| 1.899999999999897 | 0.74 | 0.956 | 0.999 |
| 1.904999999999897 | 0.741 | 0.957 | 0.999 |
| 1.909999999999897 | 0.742 | 0.957 | 0.999 |
| 1.914999999999897 | 0.743 | 0.958 | 0.999 |
| 1.919999999999897 | 0.744 | 0.958 | 0.999 |
| 1.924999999999897 | 0.745 | 0.958 | 0.999 |
| 1.929999999999896 | 0.746 | 0.959 | 0.999 |
| 1.934999999999896 | 0.748 | 0.959 | 0.999 |
| 1.939999999999896 | 0.749 | 0.96 | 0.999 |
| 1.944999999999896 | 0.75 | 0.96 | 0.999 |
| 1.949999999999896 | 0.751 | 0.96 | 0.999 |
| 1.954999999999896 | 0.752 | 0.961 | 0.999 |
| 1.959999999999896 | 0.753 | 0.961 | 0.999 |
| 1.964999999999896 | 0.754 | 0.961 | 0.999 |
| 1.969999999999896 | 0.755 | 0.962 | 0.999 |
| 1.974999999999895 | 0.756 | 0.962 | 0.999 |
| 1.979999999999895 | 0.757 | 0.963 | 0.999 |
| 1.984999999999895 | 0.758 | 0.963 | 0.999 |
| 1.989999999999895 | 0.759 | 0.963 | 0.999 |
| 1.994999999999895 | 0.761 | 0.964 | 0.999 |
| 1.999999999999895 | 0.762 | 0.964 | 0.999 |
| 2.004999999999895 | 0.763 | 0.964 | 0.999 |
| 2.009999999999895 | 0.764 | 0.965 | 0.999 |
| 2.014999999999895 | 0.765 | 0.965 | 0.999 |
| 2.019999999999895 | 0.766 | 0.965 | 0.999 |
| 2.024999999999895 | 0.767 | 0.966 | 0.999 |
| 2.029999999999895 | 0.768 | 0.966 | 0.999 |
| 2.034999999999894 | 0.769 | 0.966 | 0.999 |
| 2.039999999999894 | 0.77 | 0.967 | 0.999 |
| 2.044999999999894 | 0.771 | 0.967 | 0.999 |
| 2.049999999999894 | 0.772 | 0.967 | 0.999 |
| 2.054999999999894 | 0.773 | 0.968 | 0.999 |
| 2.059999999999894 | 0.774 | 0.968 | 0.999 |
| 2.064999999999894 | 0.775 | 0.968 | 0.999 |
| 2.069999999999894 | 0.776 | 0.969 | 0.999 |
| 2.074999999999894 | 0.777 | 0.969 | 1 |
| 2.079999999999893 | 0.778 | 0.969 | 1 |
| 2.084999999999893 | 0.779 | 0.97 | 1 |
| 2.089999999999893 | 0.78 | 0.97 | 1 |
| 2.094999999999893 | 0.781 | 0.97 | 1 |
| 2.099999999999893 | 0.782 | 0.97 | 1 |
| 2.104999999999893 | 0.783 | 0.971 | 1 |
| 2.109999999999893 | 0.784 | 0.971 | 1 |
| 2.114999999999893 | 0.785 | 0.971 | 1 |
| 2.119999999999893 | 0.786 | 0.972 | 1 |
| 2.124999999999893 | 0.787 | 0.972 | 1 |
| 2.129999999999892 | 0.788 | 0.972 | 1 |
| 2.134999999999892 | 0.789 | 0.972 | 1 |
| 2.139999999999892 | 0.789 | 0.973 | 1 |
| 2.144999999999892 | 0.79 | 0.973 | 1 |
| 2.149999999999892 | 0.791 | 0.973 | 1 |
| 2.154999999999892 | 0.792 | 0.973 | 1 |
| 2.159999999999892 | 0.793 | 0.974 | 1 |
| 2.164999999999892 | 0.794 | 0.974 | 1 |
| 2.169999999999892 | 0.795 | 0.974 | 1 |
| 2.174999999999891 | 0.796 | 0.975 | 1 |
| 2.179999999999891 | 0.797 | 0.975 | 1 |
| 2.184999999999891 | 0.798 | 0.975 | 1 |
| 2.189999999999891 | 0.799 | 0.975 | 1 |
| 2.194999999999891 | 0.8 | 0.976 | 1 |
| 2.199999999999891 | 0.8 | 0.976 | 1 |
| 2.204999999999891 | 0.801 | 0.976 | 1 |
| 2.209999999999891 | 0.802 | 0.976 | 1 |
| 2.214999999999891 | 0.803 | 0.976 | 1 |
| 2.21999999999989 | 0.804 | 0.977 | 1 |
| 2.22499999999989 | 0.805 | 0.977 | 1 |
| 2.22999999999989 | 0.806 | 0.977 | 1 |
| 2.23499999999989 | 0.807 | 0.977 | 1 |
| 2.23999999999989 | 0.808 | 0.978 | 1 |
| 2.24499999999989 | 0.808 | 0.978 | 1 |
| 2.24999999999989 | 0.809 | 0.978 | 1 |
| 2.25499999999989 | 0.81 | 0.978 | 1 |
| 2.25999999999989 | 0.811 | 0.978 | 1 |
| 2.26499999999989 | 0.812 | 0.979 | 1 |
| 2.269999999999889 | 0.813 | 0.979 | 1 |
| 2.274999999999889 | 0.814 | 0.979 | 1 |
| 2.279999999999889 | 0.814 | 0.979 | 1 |
| 2.284999999999889 | 0.815 | 0.979 | 1 |
| 2.289999999999889 | 0.816 | 0.98 | 1 |
| 2.294999999999889 | 0.817 | 0.98 | 1 |
| 2.299999999999889 | 0.818 | 0.98 | 1 |
| 2.304999999999889 | 0.819 | 0.98 | 1 |
| 2.309999999999889 | 0.819 | 0.98 | 1 |
| 2.314999999999888 | 0.82 | 0.981 | 1 |
| 2.319999999999888 | 0.821 | 0.981 | 1 |
| 2.324999999999888 | 0.822 | 0.981 | 1 |
| 2.329999999999888 | 0.823 | 0.981 | 1 |
| 2.334999999999888 | 0.823 | 0.981 | 1 |
| 2.339999999999888 | 0.824 | 0.982 | 1 |
| 2.344999999999888 | 0.825 | 0.982 | 1 |
| 2.349999999999888 | 0.826 | 0.982 | 1 |
| 2.354999999999888 | 0.827 | 0.982 | 1 |
| 2.359999999999887 | 0.827 | 0.982 | 1 |
| 2.364999999999887 | 0.828 | 0.983 | 1 |
| 2.369999999999887 | 0.829 | 0.983 | 1 |
| 2.374999999999887 | 0.83 | 0.983 | 1 |
| 2.379999999999887 | 0.831 | 0.983 | 1 |
| 2.384999999999887 | 0.831 | 0.983 | 1 |
| 2.389999999999887 | 0.832 | 0.983 | 1 |
| 2.394999999999887 | 0.833 | 0.984 | 1 |
| 2.399999999999887 | 0.834 | 0.984 | 1 |
| 2.404999999999887 | 0.834 | 0.984 | 1 |
| 2.409999999999886 | 0.835 | 0.984 | 1 |
| 2.414999999999886 | 0.836 | 0.984 | 1 |
| 2.419999999999886 | 0.837 | 0.984 | 1 |
| 2.424999999999886 | 0.837 | 0.984 | 1 |
| 2.429999999999886 | 0.838 | 0.985 | 1 |
| 2.434999999999886 | 0.839 | 0.985 | 1 |
| 2.439999999999886 | 0.84 | 0.985 | 1 |
| 2.444999999999886 | 0.84 | 0.985 | 1 |
| 2.449999999999886 | 0.841 | 0.985 | 1 |
| 2.454999999999885 | 0.842 | 0.985 | 1 |
| 2.459999999999885 | 0.843 | 0.986 | 1 |
| 2.464999999999885 | 0.843 | 0.986 | 1 |
| 2.469999999999885 | 0.844 | 0.986 | 1 |
| 2.474999999999885 | 0.845 | 0.986 | 1 |
| 2.479999999999885 | 0.845 | 0.986 | 1 |
| 2.484999999999885 | 0.846 | 0.986 | 1 |
| 2.489999999999885 | 0.847 | 0.986 | 1 |
| 2.494999999999885 | 0.848 | 0.986 | 1 |
| 2.499999999999884 | 0.848 | 0.987 | 1 |
| 2.504999999999884 | 0.849 | 0.987 | 1 |
| 2.509999999999884 | 0.85 | 0.987 | 1 |
| 2.514999999999884 | 0.85 | 0.987 | 1 |
| 2.519999999999884 | 0.851 | 0.987 | 1 |
| 2.524999999999884 | 0.852 | 0.987 | 1 |
| 2.529999999999884 | 0.852 | 0.987 | 1 |
| 2.534999999999884 | 0.853 | 0.988 | 1 |
| 2.539999999999884 | 0.854 | 0.988 | 1 |
| 2.544999999999884 | 0.854 | 0.988 | 1 |
| 2.549999999999883 | 0.855 | 0.988 | 1 |
| 2.554999999999883 | 0.856 | 0.988 | 1 |
| 2.559999999999883 | 0.856 | 0.988 | 1 |
| 2.564999999999883 | 0.857 | 0.988 | 1 |
| 2.569999999999883 | 0.858 | 0.988 | 1 |
| 2.574999999999883 | 0.858 | 0.988 | 1 |
| 2.579999999999883 | 0.859 | 0.989 | 1 |
| 2.584999999999883 | 0.86 | 0.989 | 1 |
| 2.589999999999883 | 0.86 | 0.989 | 1 |
| 2.594999999999882 | 0.861 | 0.989 | 1 |
| 2.599999999999882 | 0.862 | 0.989 | 1 |
| 2.604999999999882 | 0.862 | 0.989 | 1 |
| 2.609999999999882 | 0.863 | 0.989 | 1 |
| 2.614999999999882 | 0.864 | 0.989 | 1 |
| 2.619999999999882 | 0.864 | 0.989 | 1 |
| 2.624999999999882 | 0.865 | 0.99 | 1 |
| 2.629999999999882 | 0.866 | 0.99 | 1 |
| 2.634999999999882 | 0.866 | 0.99 | 1 |
| 2.639999999999881 | 0.867 | 0.99 | 1 |
| 2.644999999999881 | 0.867 | 0.99 | 1 |
| 2.649999999999881 | 0.868 | 0.99 | 1 |
| 2.654999999999881 | 0.869 | 0.99 | 1 |
| 2.659999999999881 | 0.869 | 0.99 | 1 |
| 2.664999999999881 | 0.87 | 0.99 | 1 |
| 2.669999999999881 | 0.87 | 0.99 | 1 |
| 2.674999999999881 | 0.871 | 0.991 | 1 |
| 2.679999999999881 | 0.872 | 0.991 | 1 |
| 2.68499999999988 | 0.872 | 0.991 | 1 |
| 2.68999999999988 | 0.873 | 0.991 | 1 |
| 2.69499999999988 | 0.873 | 0.991 | 1 |
| 2.69999999999988 | 0.874 | 0.991 | 1 |
| 2.70499999999988 | 0.875 | 0.991 | 1 |
| 2.70999999999988 | 0.875 | 0.991 | 1 |
| 2.71499999999988 | 0.876 | 0.991 | 1 |
| 2.71999999999988 | 0.876 | 0.991 | 1 |
| 2.72499999999988 | 0.877 | 0.991 | 1 |
| 2.72999999999988 | 0.878 | 0.992 | 1 |
| 2.734999999999879 | 0.878 | 0.992 | 1 |
| 2.739999999999879 | 0.879 | 0.992 | 1 |
| 2.744999999999879 | 0.879 | 0.992 | 1 |
| 2.749999999999879 | 0.88 | 0.992 | 1 |
| 2.754999999999879 | 0.88 | 0.992 | 1 |
| 2.759999999999879 | 0.881 | 0.992 | 1 |
| 2.764999999999879 | 0.882 | 0.992 | 1 |
| 2.769999999999879 | 0.882 | 0.992 | 1 |
| 2.774999999999879 | 0.883 | 0.992 | 1 |
| 2.779999999999878 | 0.883 | 0.992 | 1 |
| 2.784999999999878 | 0.884 | 0.992 | 1 |
| 2.789999999999878 | 0.884 | 0.992 | 1 |
| 2.794999999999878 | 0.885 | 0.993 | 1 |
| 2.799999999999878 | 0.885 | 0.993 | 1 |
| 2.804999999999878 | 0.886 | 0.993 | 1 |
| 2.809999999999878 | 0.886 | 0.993 | 1 |
| 2.814999999999878 | 0.887 | 0.993 | 1 |
| 2.819999999999878 | 0.887 | 0.993 | 1 |
| 2.824999999999878 | 0.888 | 0.993 | 1 |
| 2.829999999999877 | 0.889 | 0.993 | 1 |
| 2.834999999999877 | 0.889 | 0.993 | 1 |
| 2.839999999999877 | 0.89 | 0.993 | 1 |
| 2.844999999999877 | 0.89 | 0.993 | 1 |
| 2.849999999999877 | 0.891 | 0.993 | 1 |
| 2.854999999999877 | 0.891 | 0.993 | 1 |
| 2.859999999999877 | 0.892 | 0.993 | 1 |
| 2.864999999999877 | 0.892 | 0.994 | 1 |
| 2.869999999999877 | 0.893 | 0.994 | 1 |
| 2.874999999999876 | 0.893 | 0.994 | 1 |
| 2.879999999999876 | 0.894 | 0.994 | 1 |
| 2.884999999999876 | 0.894 | 0.994 | 1 |
| 2.889999999999876 | 0.895 | 0.994 | 1 |
| 2.894999999999876 | 0.895 | 0.994 | 1 |
| 2.899999999999876 | 0.896 | 0.994 | 1 |
| 2.904999999999876 | 0.896 | 0.994 | 1 |
| 2.909999999999876 | 0.897 | 0.994 | 1 |
| 2.914999999999876 | 0.897 | 0.994 | 1 |
| 2.919999999999876 | 0.898 | 0.994 | 1 |
| 2.924999999999875 | 0.898 | 0.994 | 1 |
| 2.929999999999875 | 0.899 | 0.994 | 1 |
| 2.934999999999875 | 0.899 | 0.994 | 1 |
| 2.939999999999875 | 0.9 | 0.994 | 1 |
| 2.944999999999875 | 0.9 | 0.994 | 1 |
| 2.949999999999875 | 0.901 | 0.995 | 1 |
| 2.954999999999875 | 0.901 | 0.995 | 1 |
| 2.959999999999875 | 0.901 | 0.995 | 1 |
| 2.964999999999875 | 0.902 | 0.995 | 1 |
| 2.969999999999874 | 0.902 | 0.995 | 1 |
| 2.974999999999874 | 0.903 | 0.995 | 1 |
| 2.979999999999874 | 0.903 | 0.995 | 1 |
| 2.984999999999874 | 0.904 | 0.995 | 1 |
| 2.989999999999874 | 0.904 | 0.995 | 1 |
| 2.994999999999874 | 0.905 | 0.995 | 1 |
| 2.999999999999874 | 0.905 | 0.995 | 1 |
| 3.004999999999874 | 0.906 | 0.995 | 1 |
| 3.009999999999874 | 0.906 | 0.995 | 1 |
| 3.014999999999874 | 0.906 | 0.995 | 1 |
| 3.019999999999873 | 0.907 | 0.995 | 1 |
| 3.024999999999873 | 0.907 | 0.995 | 1 |
| 3.029999999999873 | 0.908 | 0.995 | 1 |
| 3.034999999999873 | 0.908 | 0.995 | 1 |
| 3.039999999999873 | 0.909 | 0.995 | 1 |
| 3.044999999999873 | 0.909 | 0.995 | 1 |
| 3.049999999999873 | 0.91 | 0.996 | 1 |
| 3.054999999999873 | 0.91 | 0.996 | 1 |
| 3.059999999999873 | 0.91 | 0.996 | 1 |
| 3.064999999999872 | 0.911 | 0.996 | 1 |
| 3.069999999999872 | 0.911 | 0.996 | 1 |
| 3.074999999999872 | 0.912 | 0.996 | 1 |
| 3.079999999999872 | 0.912 | 0.996 | 1 |
| 3.084999999999872 | 0.913 | 0.996 | 1 |
| 3.089999999999872 | 0.913 | 0.996 | 1 |
| 3.094999999999872 | 0.913 | 0.996 | 1 |
| 3.099999999999872 | 0.914 | 0.996 | 1 |
| 3.104999999999872 | 0.914 | 0.996 | 1 |
| 3.109999999999872 | 0.915 | 0.996 | 1 |
| 3.114999999999871 | 0.915 | 0.996 | 1 |
| 3.119999999999871 | 0.915 | 0.996 | 1 |
| 3.124999999999871 | 0.916 | 0.996 | 1 |
| 3.129999999999871 | 0.916 | 0.996 | 1 |
| 3.134999999999871 | 0.917 | 0.996 | 1 |
| 3.139999999999871 | 0.917 | 0.996 | 1 |
| 3.144999999999871 | 0.917 | 0.996 | 1 |
| 3.149999999999871 | 0.918 | 0.996 | 1 |
| 3.154999999999871 | 0.918 | 0.996 | 1 |
| 3.15999999999987 | 0.919 | 0.996 | 1 |
| 3.16499999999987 | 0.919 | 0.996 | 1 |
| 3.16999999999987 | 0.919 | 0.996 | 1 |
| 3.17499999999987 | 0.92 | 0.997 | 1 |
| 3.17999999999987 | 0.92 | 0.997 | 1 |
| 3.18499999999987 | 0.921 | 0.997 | 1 |
| 3.18999999999987 | 0.921 | 0.997 | 1 |
| 3.19499999999987 | 0.921 | 0.997 | 1 |
| 3.19999999999987 | 0.922 | 0.997 | 1 |
| 3.204999999999869 | 0.922 | 0.997 | 1 |
| 3.209999999999869 | 0.922 | 0.997 | 1 |
| 3.214999999999869 | 0.923 | 0.997 | 1 |
| 3.219999999999869 | 0.923 | 0.997 | 1 |
| 3.224999999999869 | 0.924 | 0.997 | 1 |
| 3.229999999999869 | 0.924 | 0.997 | 1 |
| 3.234999999999869 | 0.924 | 0.997 | 1 |
| 3.239999999999869 | 0.925 | 0.997 | 1 |
| 3.244999999999869 | 0.925 | 0.997 | 1 |
| 3.249999999999869 | 0.925 | 0.997 | 1 |
| 3.254999999999868 | 0.926 | 0.997 | 1 |
| 3.259999999999868 | 0.926 | 0.997 | 1 |
| 3.264999999999868 | 0.926 | 0.997 | 1 |
| 3.269999999999868 | 0.927 | 0.997 | 1 |
| 3.274999999999868 | 0.927 | 0.997 | 1 |
| 3.279999999999868 | 0.927 | 0.997 | 1 |
| 3.284999999999868 | 0.928 | 0.997 | 1 |
| 3.289999999999868 | 0.928 | 0.997 | 1 |
| 3.294999999999868 | 0.929 | 0.997 | 1 |
| 3.299999999999867 | 0.929 | 0.997 | 1 |
| 3.304999999999867 | 0.929 | 0.997 | 1 |
| 3.309999999999867 | 0.93 | 0.997 | 1 |
| 3.314999999999867 | 0.93 | 0.997 | 1 |
| 3.319999999999867 | 0.93 | 0.997 | 1 |
| 3.324999999999867 | 0.931 | 0.997 | 1 |
| 3.329999999999867 | 0.931 | 0.997 | 1 |
| 3.334999999999867 | 0.931 | 0.997 | 1 |
| 3.339999999999867 | 0.932 | 0.997 | 1 |
| 3.344999999999866 | 0.932 | 0.998 | 1 |
| 3.349999999999866 | 0.932 | 0.998 | 1 |
| 3.354999999999866 | 0.933 | 0.998 | 1 |
| 3.359999999999866 | 0.933 | 0.998 | 1 |
| 3.364999999999866 | 0.933 | 0.998 | 1 |
| 3.369999999999866 | 0.934 | 0.998 | 1 |
| 3.374999999999866 | 0.934 | 0.998 | 1 |
| 3.379999999999866 | 0.934 | 0.998 | 1 |
| 3.384999999999866 | 0.934 | 0.998 | 1 |
| 3.389999999999866 | 0.935 | 0.998 | 1 |
| 3.394999999999865 | 0.935 | 0.998 | 1 |
| 3.399999999999865 | 0.935 | 0.998 | 1 |
| 3.404999999999865 | 0.936 | 0.998 | 1 |
| 3.409999999999865 | 0.936 | 0.998 | 1 |
| 3.414999999999865 | 0.936 | 0.998 | 1 |
| 3.419999999999865 | 0.937 | 0.998 | 1 |
| 3.424999999999865 | 0.937 | 0.998 | 1 |
| 3.429999999999865 | 0.937 | 0.998 | 1 |
| 3.434999999999865 | 0.938 | 0.998 | 1 |
| 3.439999999999864 | 0.938 | 0.998 | 1 |
| 3.444999999999864 | 0.938 | 0.998 | 1 |
| 3.449999999999864 | 0.938 | 0.998 | 1 |
| 3.454999999999864 | 0.939 | 0.998 | 1 |
| 3.459999999999864 | 0.939 | 0.998 | 1 |
| 3.464999999999864 | 0.939 | 0.998 | 1 |
| 3.469999999999864 | 0.94 | 0.998 | 1 |
| 3.474999999999864 | 0.94 | 0.998 | 1 |
| 3.479999999999864 | 0.94 | 0.998 | 1 |
| 3.484999999999864 | 0.941 | 0.998 | 1 |
| 3.489999999999863 | 0.941 | 0.998 | 1 |
| 3.494999999999863 | 0.941 | 0.998 | 1 |
| 3.499999999999863 | 0.941 | 0.998 | 1 |
| 3.504999999999863 | 0.942 | 0.998 | 1 |
| 3.509999999999863 | 0.942 | 0.998 | 1 |
| 3.514999999999863 | 0.942 | 0.998 | 1 |
| 3.519999999999863 | 0.943 | 0.998 | 1 |
| 3.524999999999863 | 0.943 | 0.998 | 1 |
| 3.529999999999863 | 0.943 | 0.998 | 1 |
| 3.534999999999862 | 0.943 | 0.998 | 1 |
| 3.539999999999862 | 0.944 | 0.998 | 1 |
| 3.544999999999862 | 0.944 | 0.998 | 1 |
| 3.549999999999862 | 0.944 | 0.998 | 1 |
| 3.554999999999862 | 0.944 | 0.998 | 1 |
| 3.559999999999862 | 0.945 | 0.998 | 1 |
| 3.564999999999862 | 0.945 | 0.998 | 1 |
| 3.569999999999862 | 0.945 | 0.998 | 1 |
| 3.574999999999862 | 0.945 | 0.998 | 1 |
| 3.579999999999862 | 0.946 | 0.998 | 1 |
| 3.584999999999861 | 0.946 | 0.998 | 1 |
| 3.589999999999861 | 0.946 | 0.998 | 1 |
| 3.594999999999861 | 0.947 | 0.998 | 1 |
| 3.599999999999861 | 0.947 | 0.999 | 1 |
| 3.604999999999861 | 0.947 | 0.999 | 1 |
| 3.609999999999861 | 0.947 | 0.999 | 1 |
| 3.614999999999861 | 0.948 | 0.999 | 1 |
| 3.619999999999861 | 0.948 | 0.999 | 1 |
| 3.62499999999986 | 0.948 | 0.999 | 1 |
| 3.62999999999986 | 0.948 | 0.999 | 1 |
| 3.63499999999986 | 0.949 | 0.999 | 1 |
| 3.63999999999986 | 0.949 | 0.999 | 1 |
| 3.64499999999986 | 0.949 | 0.999 | 1 |
| 3.64999999999986 | 0.949 | 0.999 | 1 |
| 3.65499999999986 | 0.95 | 0.999 | 1 |
| 3.65999999999986 | 0.95 | 0.999 | 1 |
| 3.66499999999986 | 0.95 | 0.999 | 1 |
| 3.669999999999859 | 0.95 | 0.999 | 1 |
| 3.674999999999859 | 0.951 | 0.999 | 1 |
| 3.679999999999859 | 0.951 | 0.999 | 1 |
| 3.684999999999859 | 0.951 | 0.999 | 1 |
| 3.689999999999859 | 0.951 | 0.999 | 1 |
| 3.694999999999859 | 0.952 | 0.999 | 1 |
| 3.699999999999859 | 0.952 | 0.999 | 1 |
| 3.704999999999859 | 0.952 | 0.999 | 1 |
| 3.709999999999859 | 0.952 | 0.999 | 1 |
| 3.714999999999859 | 0.952 | 0.999 | 1 |
| 3.719999999999858 | 0.953 | 0.999 | 1 |
| 3.724999999999858 | 0.953 | 0.999 | 1 |
| 3.729999999999858 | 0.953 | 0.999 | 1 |
| 3.734999999999858 | 0.953 | 0.999 | 1 |
| 3.739999999999858 | 0.954 | 0.999 | 1 |
| 3.744999999999858 | 0.954 | 0.999 | 1 |
| 3.749999999999858 | 0.954 | 0.999 | 1 |
| 3.754999999999858 | 0.954 | 0.999 | 1 |
| 3.759999999999858 | 0.954 | 0.999 | 1 |
| 3.764999999999857 | 0.955 | 0.999 | 1 |
| 3.769999999999857 | 0.955 | 0.999 | 1 |
| 3.774999999999857 | 0.955 | 0.999 | 1 |
| 3.779999999999857 | 0.955 | 0.999 | 1 |
| 3.784999999999857 | 0.956 | 0.999 | 1 |
| 3.789999999999857 | 0.956 | 0.999 | 1 |
| 3.794999999999857 | 0.956 | 0.999 | 1 |
| 3.799999999999857 | 0.956 | 0.999 | 1 |
| 3.804999999999857 | 0.956 | 0.999 | 1 |
| 3.809999999999857 | 0.957 | 0.999 | 1 |
| 3.814999999999856 | 0.957 | 0.999 | 1 |
| 3.819999999999856 | 0.957 | 0.999 | 1 |
| 3.824999999999856 | 0.957 | 0.999 | 1 |
| 3.829999999999856 | 0.958 | 0.999 | 1 |
| 3.834999999999856 | 0.958 | 0.999 | 1 |
| 3.839999999999856 | 0.958 | 0.999 | 1 |
| 3.844999999999856 | 0.958 | 0.999 | 1 |
| 3.849999999999856 | 0.958 | 0.999 | 1 |
| 3.854999999999856 | 0.959 | 0.999 | 1 |
| 3.859999999999855 | 0.959 | 0.999 | 1 |
| 3.864999999999855 | 0.959 | 0.999 | 1 |
| 3.869999999999855 | 0.959 | 0.999 | 1 |
| 3.874999999999855 | 0.959 | 0.999 | 1 |
| 3.879999999999855 | 0.96 | 0.999 | 1 |
| 3.884999999999855 | 0.96 | 0.999 | 1 |
| 3.889999999999855 | 0.96 | 0.999 | 1 |
| 3.894999999999855 | 0.96 | 0.999 | 1 |
| 3.899999999999855 | 0.96 | 0.999 | 1 |
| 3.904999999999855 | 0.961 | 0.999 | 1 |
| 3.909999999999854 | 0.961 | 0.999 | 1 |
| 3.914999999999854 | 0.961 | 0.999 | 1 |
| 3.919999999999854 | 0.961 | 0.999 | 1 |
| 3.924999999999854 | 0.961 | 0.999 | 1 |
| 3.929999999999854 | 0.961 | 0.999 | 1 |
| 3.934999999999854 | 0.962 | 0.999 | 1 |
| 3.939999999999854 | 0.962 | 0.999 | 1 |
| 3.944999999999854 | 0.962 | 0.999 | 1 |
| 3.949999999999854 | 0.962 | 0.999 | 1 |
| 3.954999999999853 | 0.962 | 0.999 | 1 |
| 3.959999999999853 | 0.963 | 0.999 | 1 |
| 3.964999999999853 | 0.963 | 0.999 | 1 |
| 3.969999999999853 | 0.963 | 0.999 | 1 |
| 3.974999999999853 | 0.963 | 0.999 | 1 |
| 3.979999999999853 | 0.963 | 0.999 | 1 |
| 3.984999999999853 | 0.963 | 0.999 | 1 |
| 3.989999999999853 | 0.964 | 0.999 | 1 |
| 3.994999999999853 | 0.964 | 0.999 | 1 |
| 3.999999999999853 | 0.964 | 0.999 | 1 |
| 4.004999999999852 | 0.964 | 0.999 | 1 |
| 4.009999999999852 | 0.964 | 0.999 | 1 |
| 4.014999999999852 | 0.965 | 0.999 | 1 |
| 4.019999999999852 | 0.965 | 0.999 | 1 |
| 4.024999999999852 | 0.965 | 0.999 | 1 |
| 4.029999999999852 | 0.965 | 0.999 | 1 |
| 4.034999999999852 | 0.965 | 0.999 | 1 |
| 4.039999999999851 | 0.965 | 0.999 | 1 |
| 4.044999999999852 | 0.966 | 0.999 | 1 |
| 4.049999999999851 | 0.966 | 0.999 | 1 |
| 4.054999999999851 | 0.966 | 0.999 | 1 |
| 4.059999999999851 | 0.966 | 0.999 | 1 |
| 4.064999999999851 | 0.966 | 0.999 | 1 |
| 4.069999999999851 | 0.966 | 0.999 | 1 |
| 4.074999999999851 | 0.967 | 0.999 | 1 |
| 4.07999999999985 | 0.967 | 0.999 | 1 |
| 4.084999999999851 | 0.967 | 0.999 | 1 |
| 4.08999999999985 | 0.967 | 0.999 | 1 |
| 4.094999999999851 | 0.967 | 0.999 | 1 |
| 4.09999999999985 | 0.967 | 0.999 | 1 |
| 4.10499999999985 | 0.968 | 0.999 | 1 |
| 4.10999999999985 | 0.968 | 0.999 | 1 |
| 4.11499999999985 | 0.968 | 0.999 | 1 |
| 4.11999999999985 | 0.968 | 0.999 | 1 |
| 4.12499999999985 | 0.968 | 0.999 | 1 |
| 4.12999999999985 | 0.968 | 0.999 | 1 |
| 4.13499999999985 | 0.968 | 0.999 | 1 |
| 4.13999999999985 | 0.969 | 0.999 | 1 |
| 4.144999999999849 | 0.969 | 0.999 | 1 |
| 4.14999999999985 | 0.969 | 1 | 1 |
| 4.154999999999849 | 0.969 | 1 | 1 |
| 4.15999999999985 | 0.969 | 1 | 1 |
| 4.164999999999849 | 0.969 | 1 | 1 |
| 4.169999999999849 | 0.97 | 1 | 1 |
| 4.174999999999849 | 0.97 | 1 | 1 |
| 4.179999999999848 | 0.97 | 1 | 1 |
| 4.184999999999849 | 0.97 | 1 | 1 |
| 4.189999999999848 | 0.97 | 1 | 1 |
| 4.194999999999848 | 0.97 | 1 | 1 |
| 4.199999999999848 | 0.97 | 1 | 1 |
| 4.204999999999848 | 0.971 | 1 | 1 |
| 4.209999999999848 | 0.971 | 1 | 1 |
| 4.214999999999848 | 0.971 | 1 | 1 |
| 4.219999999999847 | 0.971 | 1 | 1 |
| 4.224999999999848 | 0.971 | 1 | 1 |
| 4.229999999999847 | 0.971 | 1 | 1 |
| 4.234999999999847 | 0.971 | 1 | 1 |
| 4.239999999999847 | 0.972 | 1 | 1 |
| 4.244999999999847 | 0.972 | 1 | 1 |
| 4.249999999999847 | 0.972 | 1 | 1 |
| 4.254999999999847 | 0.972 | 1 | 1 |
| 4.259999999999846 | 0.972 | 1 | 1 |
| 4.264999999999847 | 0.972 | 1 | 1 |
| 4.269999999999846 | 0.972 | 1 | 1 |
| 4.274999999999846 | 0.973 | 1 | 1 |
| 4.279999999999846 | 0.973 | 1 | 1 |
| 4.284999999999846 | 0.973 | 1 | 1 |
| 4.289999999999846 | 0.973 | 1 | 1 |
| 4.294999999999846 | 0.973 | 1 | 1 |
| 4.299999999999846 | 0.973 | 1 | 1 |
| 4.304999999999846 | 0.973 | 1 | 1 |
| 4.309999999999845 | 0.973 | 1 | 1 |
| 4.314999999999846 | 0.974 | 1 | 1 |
| 4.319999999999845 | 0.974 | 1 | 1 |
| 4.324999999999846 | 0.974 | 1 | 1 |
| 4.329999999999845 | 0.974 | 1 | 1 |
| 4.334999999999845 | 0.974 | 1 | 1 |
| 4.339999999999845 | 0.974 | 1 | 1 |
| 4.344999999999845 | 0.974 | 1 | 1 |
| 4.349999999999845 | 0.975 | 1 | 1 |
| 4.354999999999845 | 0.975 | 1 | 1 |
| 4.359999999999844 | 0.975 | 1 | 1 |
| 4.364999999999845 | 0.975 | 1 | 1 |
| 4.369999999999844 | 0.975 | 1 | 1 |
| 4.374999999999844 | 0.975 | 1 | 1 |
| 4.379999999999844 | 0.975 | 1 | 1 |
| 4.384999999999844 | 0.975 | 1 | 1 |
| 4.389999999999844 | 0.976 | 1 | 1 |
| 4.394999999999844 | 0.976 | 1 | 1 |
| 4.399999999999844 | 0.976 | 1 | 1 |
| 4.404999999999844 | 0.976 | 1 | 1 |
| 4.409999999999843 | 0.976 | 1 | 1 |
| 4.414999999999844 | 0.976 | 1 | 1 |
| 4.419999999999843 | 0.976 | 1 | 1 |
| 4.424999999999843 | 0.976 | 1 | 1 |
| 4.429999999999843 | 0.976 | 1 | 1 |
| 4.434999999999843 | 0.977 | 1 | 1 |
| 4.439999999999843 | 0.977 | 1 | 1 |
| 4.444999999999843 | 0.977 | 1 | 1 |
| 4.449999999999842 | 0.977 | 1 | 1 |
| 4.454999999999843 | 0.977 | 1 | 1 |
| 4.459999999999842 | 0.977 | 1 | 1 |
| 4.464999999999843 | 0.977 | 1 | 1 |
| 4.469999999999842 | 0.977 | 1 | 1 |
| 4.474999999999842 | 0.977 | 1 | 1 |
| 4.479999999999842 | 0.978 | 1 | 1 |
| 4.484999999999842 | 0.978 | 1 | 1 |
| 4.489999999999842 | 0.978 | 1 | 1 |
| 4.494999999999842 | 0.978 | 1 | 1 |
| 4.499999999999841 | 0.978 | 1 | 1 |
| 4.504999999999842 | 0.978 | 1 | 1 |
| 4.509999999999841 | 0.978 | 1 | 1 |
| 4.514999999999842 | 0.978 | 1 | 1 |
| 4.519999999999841 | 0.978 | 1 | 1 |
| 4.524999999999841 | 0.979 | 1 | 1 |
| 4.529999999999841 | 0.979 | 1 | 1 |
| 4.534999999999841 | 0.979 | 1 | 1 |
| 4.53999999999984 | 0.979 | 1 | 1 |
| 4.544999999999841 | 0.979 | 1 | 1 |
| 4.54999999999984 | 0.979 | 1 | 1 |
| 4.554999999999841 | 0.979 | 1 | 1 |
| 4.55999999999984 | 0.979 | 1 | 1 |
| 4.564999999999841 | 0.979 | 1 | 1 |
| 4.56999999999984 | 0.979 | 1 | 1 |
| 4.57499999999984 | 0.98 | 1 | 1 |
| 4.57999999999984 | 0.98 | 1 | 1 |
| 4.58499999999984 | 0.98 | 1 | 1 |
| 4.58999999999984 | 0.98 | 1 | 1 |
| 4.59499999999984 | 0.98 | 1 | 1 |
| 4.59999999999984 | 0.98 | 1 | 1 |
| 4.60499999999984 | 0.98 | 1 | 1 |
| 4.60999999999984 | 0.98 | 1 | 1 |
| 4.614999999999839 | 0.98 | 1 | 1 |
| 4.61999999999984 | 0.98 | 1 | 1 |
| 4.624999999999839 | 0.981 | 1 | 1 |
| 4.62999999999984 | 0.981 | 1 | 1 |
| 4.634999999999839 | 0.981 | 1 | 1 |
| 4.639999999999838 | 0.981 | 1 | 1 |
| 4.644999999999839 | 0.981 | 1 | 1 |
| 4.649999999999838 | 0.981 | 1 | 1 |
| 4.654999999999839 | 0.981 | 1 | 1 |
| 4.659999999999838 | 0.981 | 1 | 1 |
| 4.664999999999838 | 0.981 | 1 | 1 |
| 4.669999999999838 | 0.981 | 1 | 1 |
| 4.674999999999838 | 0.982 | 1 | 1 |
| 4.679999999999837 | 0.982 | 1 | 1 |
| 4.684999999999838 | 0.982 | 1 | 1 |
| 4.689999999999837 | 0.982 | 1 | 1 |
| 4.694999999999838 | 0.982 | 1 | 1 |
| 4.699999999999837 | 0.982 | 1 | 1 |
| 4.704999999999837 | 0.982 | 1 | 1 |
| 4.709999999999837 | 0.982 | 1 | 1 |
| 4.714999999999837 | 0.982 | 1 | 1 |
| 4.719999999999837 | 0.982 | 1 | 1 |
| 4.724999999999837 | 0.982 | 1 | 1 |
| 4.729999999999836 | 0.983 | 1 | 1 |
| 4.734999999999836 | 0.983 | 1 | 1 |
| 4.739999999999836 | 0.983 | 1 | 1 |
| 4.744999999999836 | 0.983 | 1 | 1 |
| 4.749999999999836 | 0.983 | 1 | 1 |
| 4.754999999999836 | 0.983 | 1 | 1 |
| 4.759999999999836 | 0.983 | 1 | 1 |
| 4.764999999999836 | 0.983 | 1 | 1 |
| 4.769999999999836 | 0.983 | 1 | 1 |
| 4.774999999999835 | 0.983 | 1 | 1 |
| 4.779999999999835 | 0.983 | 1 | 1 |
| 4.784999999999835 | 0.983 | 1 | 1 |
| 4.789999999999835 | 0.984 | 1 | 1 |
| 4.794999999999835 | 0.984 | 1 | 1 |
| 4.799999999999835 | 0.984 | 1 | 1 |
| 4.804999999999835 | 0.984 | 1 | 1 |
| 4.809999999999835 | 0.984 | 1 | 1 |
| 4.814999999999835 | 0.984 | 1 | 1 |
| 4.819999999999835 | 0.984 | 1 | 1 |
| 4.824999999999835 | 0.984 | 1 | 1 |
| 4.829999999999834 | 0.984 | 1 | 1 |
| 4.834999999999834 | 0.984 | 1 | 1 |
| 4.839999999999834 | 0.984 | 1 | 1 |
| 4.844999999999834 | 0.984 | 1 | 1 |
| 4.849999999999834 | 0.984 | 1 | 1 |
| 4.854999999999834 | 0.985 | 1 | 1 |
| 4.859999999999834 | 0.985 | 1 | 1 |
| 4.864999999999834 | 0.985 | 1 | 1 |
| 4.869999999999834 | 0.985 | 1 | 1 |
| 4.874999999999834 | 0.985 | 1 | 1 |
| 4.879999999999833 | 0.985 | 1 | 1 |
| 4.884999999999834 | 0.985 | 1 | 1 |
| 4.889999999999833 | 0.985 | 1 | 1 |
| 4.894999999999833 | 0.985 | 1 | 1 |
| 4.899999999999833 | 0.985 | 1 | 1 |
| 4.904999999999833 | 0.985 | 1 | 1 |
| 4.909999999999833 | 0.985 | 1 | 1 |
| 4.914999999999833 | 0.985 | 1 | 1 |
| 4.919999999999832 | 0.986 | 1 | 1 |
| 4.924999999999833 | 0.986 | 1 | 1 |
| 4.929999999999832 | 0.986 | 1 | 1 |
| 4.934999999999832 | 0.986 | 1 | 1 |
| 4.939999999999832 | 0.986 | 1 | 1 |
| 4.944999999999832 | 0.986 | 1 | 1 |
| 4.949999999999832 | 0.986 | 1 | 1 |
| 4.954999999999832 | 0.986 | 1 | 1 |
| 4.959999999999832 | 0.986 | 1 | 1 |
| 4.964999999999832 | 0.986 | 1 | 1 |
| 4.969999999999831 | 0.986 | 1 | 1 |
| 4.974999999999831 | 0.986 | 1 | 1 |
| 4.97999999999983 | 0.986 | 1 | 1 |
| 4.984999999999831 | 0.986 | 1 | 1 |
| 4.98999999999983 | 0.986 | 1 | 1 |
| 4.994999999999831 | 0.987 | 1 | 1 |
| 4.99999999999983 | 0.987 | 1 | 1 |